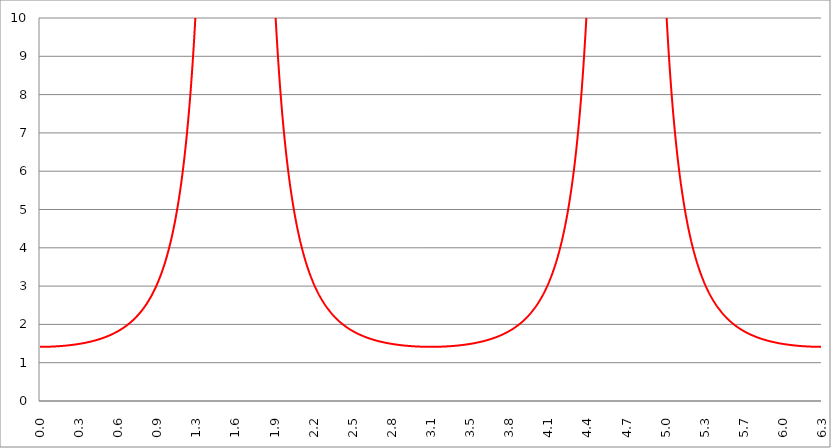
| Category | Series 1 | Series 0 | Series 2 |
|---|---|---|---|
| 0.0 | 1.414 |  |  |
| 0.00314159265358979 | 1.414 |  |  |
| 0.00628318530717958 | 1.414 |  |  |
| 0.00942477796076938 | 1.414 |  |  |
| 0.0125663706143592 | 1.414 |  |  |
| 0.015707963267949 | 1.414 |  |  |
| 0.0188495559215388 | 1.414 |  |  |
| 0.0219911485751285 | 1.415 |  |  |
| 0.0251327412287183 | 1.415 |  |  |
| 0.0282743338823081 | 1.415 |  |  |
| 0.0314159265358979 | 1.415 |  |  |
| 0.0345575191894877 | 1.415 |  |  |
| 0.0376991118430775 | 1.415 |  |  |
| 0.0408407044966673 | 1.415 |  |  |
| 0.0439822971502571 | 1.416 |  |  |
| 0.0471238898038469 | 1.416 |  |  |
| 0.0502654824574367 | 1.416 |  |  |
| 0.0534070751110265 | 1.416 |  |  |
| 0.0565486677646163 | 1.416 |  |  |
| 0.059690260418206 | 1.417 |  |  |
| 0.0628318530717958 | 1.417 |  |  |
| 0.0659734457253856 | 1.417 |  |  |
| 0.0691150383789754 | 1.418 |  |  |
| 0.0722566310325652 | 1.418 |  |  |
| 0.075398223686155 | 1.418 |  |  |
| 0.0785398163397448 | 1.419 |  |  |
| 0.0816814089933346 | 1.419 |  |  |
| 0.0848230016469244 | 1.419 |  |  |
| 0.0879645943005142 | 1.42 |  |  |
| 0.091106186954104 | 1.42 |  |  |
| 0.0942477796076937 | 1.421 |  |  |
| 0.0973893722612835 | 1.421 |  |  |
| 0.100530964914873 | 1.421 |  |  |
| 0.103672557568463 | 1.422 |  |  |
| 0.106814150222053 | 1.422 |  |  |
| 0.109955742875643 | 1.423 |  |  |
| 0.113097335529233 | 1.423 |  |  |
| 0.116238928182822 | 1.424 |  |  |
| 0.119380520836412 | 1.424 |  |  |
| 0.122522113490002 | 1.425 |  |  |
| 0.125663706143592 | 1.426 |  |  |
| 0.128805298797181 | 1.426 |  |  |
| 0.131946891450771 | 1.427 |  |  |
| 0.135088484104361 | 1.427 |  |  |
| 0.138230076757951 | 1.428 |  |  |
| 0.141371669411541 | 1.429 |  |  |
| 0.14451326206513 | 1.429 |  |  |
| 0.14765485471872 | 1.43 |  |  |
| 0.15079644737231 | 1.431 |  |  |
| 0.1539380400259 | 1.431 |  |  |
| 0.15707963267949 | 1.432 |  |  |
| 0.160221225333079 | 1.433 |  |  |
| 0.163362817986669 | 1.434 |  |  |
| 0.166504410640259 | 1.434 |  |  |
| 0.169646003293849 | 1.435 |  |  |
| 0.172787595947439 | 1.436 |  |  |
| 0.175929188601028 | 1.437 |  |  |
| 0.179070781254618 | 1.438 |  |  |
| 0.182212373908208 | 1.438 |  |  |
| 0.185353966561798 | 1.439 |  |  |
| 0.188495559215388 | 1.44 |  |  |
| 0.191637151868977 | 1.441 |  |  |
| 0.194778744522567 | 1.442 |  |  |
| 0.197920337176157 | 1.443 |  |  |
| 0.201061929829747 | 1.444 |  |  |
| 0.204203522483336 | 1.445 |  |  |
| 0.207345115136926 | 1.446 |  |  |
| 0.210486707790516 | 1.447 |  |  |
| 0.213628300444106 | 1.448 |  |  |
| 0.216769893097696 | 1.449 |  |  |
| 0.219911485751285 | 1.45 |  |  |
| 0.223053078404875 | 1.451 |  |  |
| 0.226194671058465 | 1.452 |  |  |
| 0.229336263712055 | 1.453 |  |  |
| 0.232477856365645 | 1.454 |  |  |
| 0.235619449019234 | 1.456 |  |  |
| 0.238761041672824 | 1.457 |  |  |
| 0.241902634326414 | 1.458 |  |  |
| 0.245044226980004 | 1.459 |  |  |
| 0.248185819633594 | 1.46 |  |  |
| 0.251327412287183 | 1.462 |  |  |
| 0.254469004940773 | 1.463 |  |  |
| 0.257610597594363 | 1.464 |  |  |
| 0.260752190247953 | 1.465 |  |  |
| 0.263893782901543 | 1.467 |  |  |
| 0.267035375555132 | 1.468 |  |  |
| 0.270176968208722 | 1.469 |  |  |
| 0.273318560862312 | 1.471 |  |  |
| 0.276460153515902 | 1.472 |  |  |
| 0.279601746169492 | 1.474 |  |  |
| 0.282743338823082 | 1.475 |  |  |
| 0.285884931476671 | 1.477 |  |  |
| 0.289026524130261 | 1.478 |  |  |
| 0.292168116783851 | 1.48 |  |  |
| 0.295309709437441 | 1.481 |  |  |
| 0.298451302091031 | 1.483 |  |  |
| 0.30159289474462 | 1.484 |  |  |
| 0.30473448739821 | 1.486 |  |  |
| 0.3078760800518 | 1.487 |  |  |
| 0.31101767270539 | 1.489 |  |  |
| 0.31415926535898 | 1.491 |  |  |
| 0.31730085801257 | 1.492 |  |  |
| 0.320442450666159 | 1.494 |  |  |
| 0.323584043319749 | 1.496 |  |  |
| 0.326725635973339 | 1.498 |  |  |
| 0.329867228626929 | 1.499 |  |  |
| 0.333008821280519 | 1.501 |  |  |
| 0.336150413934108 | 1.503 |  |  |
| 0.339292006587698 | 1.505 |  |  |
| 0.342433599241288 | 1.507 |  |  |
| 0.345575191894878 | 1.509 |  |  |
| 0.348716784548468 | 1.511 |  |  |
| 0.351858377202058 | 1.513 |  |  |
| 0.354999969855647 | 1.515 |  |  |
| 0.358141562509237 | 1.517 |  |  |
| 0.361283155162827 | 1.519 |  |  |
| 0.364424747816417 | 1.521 |  |  |
| 0.367566340470007 | 1.523 |  |  |
| 0.370707933123597 | 1.525 |  |  |
| 0.373849525777186 | 1.527 |  |  |
| 0.376991118430776 | 1.529 |  |  |
| 0.380132711084366 | 1.531 |  |  |
| 0.383274303737956 | 1.533 |  |  |
| 0.386415896391546 | 1.536 |  |  |
| 0.389557489045135 | 1.538 |  |  |
| 0.392699081698725 | 1.54 |  |  |
| 0.395840674352315 | 1.543 |  |  |
| 0.398982267005905 | 1.545 |  |  |
| 0.402123859659495 | 1.547 |  |  |
| 0.405265452313085 | 1.55 |  |  |
| 0.408407044966674 | 1.552 |  |  |
| 0.411548637620264 | 1.555 |  |  |
| 0.414690230273854 | 1.557 |  |  |
| 0.417831822927444 | 1.56 |  |  |
| 0.420973415581034 | 1.562 |  |  |
| 0.424115008234623 | 1.565 |  |  |
| 0.427256600888213 | 1.568 |  |  |
| 0.430398193541803 | 1.57 |  |  |
| 0.433539786195393 | 1.573 |  |  |
| 0.436681378848983 | 1.576 |  |  |
| 0.439822971502573 | 1.579 |  |  |
| 0.442964564156162 | 1.581 |  |  |
| 0.446106156809752 | 1.584 |  |  |
| 0.449247749463342 | 1.587 |  |  |
| 0.452389342116932 | 1.59 |  |  |
| 0.455530934770522 | 1.593 |  |  |
| 0.458672527424111 | 1.596 |  |  |
| 0.461814120077701 | 1.599 |  |  |
| 0.464955712731291 | 1.602 |  |  |
| 0.468097305384881 | 1.605 |  |  |
| 0.471238898038471 | 1.608 |  |  |
| 0.474380490692061 | 1.611 |  |  |
| 0.47752208334565 | 1.615 |  |  |
| 0.48066367599924 | 1.618 |  |  |
| 0.48380526865283 | 1.621 |  |  |
| 0.48694686130642 | 1.625 |  |  |
| 0.49008845396001 | 1.628 |  |  |
| 0.493230046613599 | 1.631 |  |  |
| 0.496371639267189 | 1.635 |  |  |
| 0.499513231920779 | 1.638 |  |  |
| 0.502654824574369 | 1.642 |  |  |
| 0.505796417227959 | 1.645 |  |  |
| 0.508938009881549 | 1.649 |  |  |
| 0.512079602535138 | 1.653 |  |  |
| 0.515221195188728 | 1.657 |  |  |
| 0.518362787842318 | 1.66 |  |  |
| 0.521504380495908 | 1.664 |  |  |
| 0.524645973149498 | 1.668 |  |  |
| 0.527787565803087 | 1.672 |  |  |
| 0.530929158456677 | 1.676 |  |  |
| 0.534070751110267 | 1.68 |  |  |
| 0.537212343763857 | 1.684 |  |  |
| 0.540353936417447 | 1.688 |  |  |
| 0.543495529071037 | 1.692 |  |  |
| 0.546637121724626 | 1.696 |  |  |
| 0.549778714378216 | 1.701 |  |  |
| 0.552920307031806 | 1.705 |  |  |
| 0.556061899685396 | 1.709 |  |  |
| 0.559203492338986 | 1.714 |  |  |
| 0.562345084992576 | 1.718 |  |  |
| 0.565486677646165 | 1.723 |  |  |
| 0.568628270299755 | 1.727 |  |  |
| 0.571769862953345 | 1.732 |  |  |
| 0.574911455606935 | 1.737 |  |  |
| 0.578053048260525 | 1.741 |  |  |
| 0.581194640914114 | 1.746 |  |  |
| 0.584336233567704 | 1.751 |  |  |
| 0.587477826221294 | 1.756 |  |  |
| 0.590619418874884 | 1.761 |  |  |
| 0.593761011528474 | 1.766 |  |  |
| 0.596902604182064 | 1.771 |  |  |
| 0.600044196835653 | 1.776 |  |  |
| 0.603185789489243 | 1.782 |  |  |
| 0.606327382142833 | 1.787 |  |  |
| 0.609468974796423 | 1.792 |  |  |
| 0.612610567450013 | 1.798 |  |  |
| 0.615752160103602 | 1.803 |  |  |
| 0.618893752757192 | 1.809 |  |  |
| 0.622035345410782 | 1.814 |  |  |
| 0.625176938064372 | 1.82 |  |  |
| 0.628318530717962 | 1.826 |  |  |
| 0.631460123371551 | 1.832 |  |  |
| 0.634601716025141 | 1.838 |  |  |
| 0.637743308678731 | 1.844 |  |  |
| 0.640884901332321 | 1.85 |  |  |
| 0.644026493985911 | 1.856 |  |  |
| 0.647168086639501 | 1.862 |  |  |
| 0.65030967929309 | 1.869 |  |  |
| 0.65345127194668 | 1.875 |  |  |
| 0.65659286460027 | 1.882 |  |  |
| 0.65973445725386 | 1.888 |  |  |
| 0.66287604990745 | 1.895 |  |  |
| 0.666017642561039 | 1.902 |  |  |
| 0.669159235214629 | 1.908 |  |  |
| 0.672300827868219 | 1.915 |  |  |
| 0.675442420521809 | 1.922 |  |  |
| 0.678584013175399 | 1.93 |  |  |
| 0.681725605828989 | 1.937 |  |  |
| 0.684867198482578 | 1.944 |  |  |
| 0.688008791136168 | 1.951 |  |  |
| 0.691150383789758 | 1.959 |  |  |
| 0.694291976443348 | 1.966 |  |  |
| 0.697433569096938 | 1.974 |  |  |
| 0.700575161750528 | 1.982 |  |  |
| 0.703716754404117 | 1.99 |  |  |
| 0.706858347057707 | 1.998 |  |  |
| 0.709999939711297 | 2.006 |  |  |
| 0.713141532364887 | 2.014 |  |  |
| 0.716283125018477 | 2.022 |  |  |
| 0.719424717672066 | 2.031 |  |  |
| 0.722566310325656 | 2.039 |  |  |
| 0.725707902979246 | 2.048 |  |  |
| 0.728849495632836 | 2.057 |  |  |
| 0.731991088286426 | 2.066 |  |  |
| 0.735132680940016 | 2.075 |  |  |
| 0.738274273593605 | 2.084 |  |  |
| 0.741415866247195 | 2.093 |  |  |
| 0.744557458900785 | 2.102 |  |  |
| 0.747699051554375 | 2.112 |  |  |
| 0.750840644207965 | 2.121 |  |  |
| 0.753982236861554 | 2.131 |  |  |
| 0.757123829515144 | 2.141 |  |  |
| 0.760265422168734 | 2.151 |  |  |
| 0.763407014822324 | 2.161 |  |  |
| 0.766548607475914 | 2.171 |  |  |
| 0.769690200129504 | 2.182 |  |  |
| 0.772831792783093 | 2.192 |  |  |
| 0.775973385436683 | 2.203 |  |  |
| 0.779114978090273 | 2.214 |  |  |
| 0.782256570743863 | 2.225 |  |  |
| 0.785398163397453 | 2.236 |  |  |
| 0.788539756051042 | 2.247 |  |  |
| 0.791681348704632 | 2.259 |  |  |
| 0.794822941358222 | 2.27 |  |  |
| 0.797964534011812 | 2.282 |  |  |
| 0.801106126665402 | 2.294 |  |  |
| 0.804247719318992 | 2.306 |  |  |
| 0.807389311972581 | 2.319 |  |  |
| 0.810530904626171 | 2.331 |  |  |
| 0.813672497279761 | 2.344 |  |  |
| 0.816814089933351 | 2.357 |  |  |
| 0.819955682586941 | 2.37 |  |  |
| 0.823097275240531 | 2.383 |  |  |
| 0.82623886789412 | 2.396 |  |  |
| 0.82938046054771 | 2.41 |  |  |
| 0.8325220532013 | 2.424 |  |  |
| 0.83566364585489 | 2.438 |  |  |
| 0.83880523850848 | 2.452 |  |  |
| 0.841946831162069 | 2.466 |  |  |
| 0.845088423815659 | 2.481 |  |  |
| 0.848230016469249 | 2.496 |  |  |
| 0.851371609122839 | 2.511 |  |  |
| 0.854513201776429 | 2.526 |  |  |
| 0.857654794430019 | 2.541 |  |  |
| 0.860796387083608 | 2.557 |  |  |
| 0.863937979737198 | 2.573 |  |  |
| 0.867079572390788 | 2.589 |  |  |
| 0.870221165044378 | 2.606 |  |  |
| 0.873362757697968 | 2.622 |  |  |
| 0.876504350351557 | 2.639 |  |  |
| 0.879645943005147 | 2.657 |  |  |
| 0.882787535658737 | 2.674 |  |  |
| 0.885929128312327 | 2.692 |  |  |
| 0.889070720965917 | 2.71 |  |  |
| 0.892212313619507 | 2.728 |  |  |
| 0.895353906273096 | 2.747 |  |  |
| 0.898495498926686 | 2.765 |  |  |
| 0.901637091580276 | 2.784 |  |  |
| 0.904778684233866 | 2.804 |  |  |
| 0.907920276887456 | 2.824 |  |  |
| 0.911061869541045 | 2.844 |  |  |
| 0.914203462194635 | 2.864 |  |  |
| 0.917345054848225 | 2.885 |  |  |
| 0.920486647501815 | 2.906 |  |  |
| 0.923628240155405 | 2.927 |  |  |
| 0.926769832808995 | 2.949 |  |  |
| 0.929911425462584 | 2.971 |  |  |
| 0.933053018116174 | 2.993 |  |  |
| 0.936194610769764 | 3.016 |  |  |
| 0.939336203423354 | 3.039 |  |  |
| 0.942477796076944 | 3.062 |  |  |
| 0.945619388730533 | 3.086 |  |  |
| 0.948760981384123 | 3.11 |  |  |
| 0.951902574037713 | 3.135 |  |  |
| 0.955044166691303 | 3.16 |  |  |
| 0.958185759344893 | 3.186 |  |  |
| 0.961327351998483 | 3.211 |  |  |
| 0.964468944652072 | 3.238 |  |  |
| 0.967610537305662 | 3.265 |  |  |
| 0.970752129959252 | 3.292 |  |  |
| 0.973893722612842 | 3.319 |  |  |
| 0.977035315266432 | 3.348 |  |  |
| 0.980176907920022 | 3.376 |  |  |
| 0.983318500573611 | 3.405 |  |  |
| 0.986460093227201 | 3.435 |  |  |
| 0.989601685880791 | 3.465 |  |  |
| 0.992743278534381 | 3.496 |  |  |
| 0.995884871187971 | 3.527 |  |  |
| 0.99902646384156 | 3.559 |  |  |
| 1.00216805649515 | 3.591 |  |  |
| 1.00530964914874 | 3.624 |  |  |
| 1.00845124180233 | 3.657 |  |  |
| 1.01159283445592 | 3.691 |  |  |
| 1.01473442710951 | 3.726 |  |  |
| 1.017876019763099 | 3.761 |  |  |
| 1.021017612416689 | 3.797 |  |  |
| 1.02415920507028 | 3.834 |  |  |
| 1.027300797723869 | 3.871 |  |  |
| 1.030442390377459 | 3.909 |  |  |
| 1.033583983031048 | 3.947 |  |  |
| 1.036725575684638 | 3.987 |  |  |
| 1.039867168338228 | 4.027 |  |  |
| 1.043008760991818 | 4.067 |  |  |
| 1.046150353645408 | 4.109 |  |  |
| 1.049291946298998 | 4.151 |  |  |
| 1.052433538952587 | 4.195 |  |  |
| 1.055575131606177 | 4.239 |  |  |
| 1.058716724259767 | 4.283 |  |  |
| 1.061858316913357 | 4.329 |  |  |
| 1.064999909566947 | 4.376 |  |  |
| 1.068141502220536 | 4.423 |  |  |
| 1.071283094874126 | 4.472 |  |  |
| 1.074424687527716 | 4.521 |  |  |
| 1.077566280181306 | 4.571 |  |  |
| 1.080707872834896 | 4.623 |  |  |
| 1.083849465488486 | 4.675 |  |  |
| 1.086991058142075 | 4.729 |  |  |
| 1.090132650795665 | 4.783 |  |  |
| 1.093274243449255 | 4.839 |  |  |
| 1.096415836102845 | 4.896 |  |  |
| 1.099557428756435 | 4.954 |  |  |
| 1.102699021410025 | 5.013 |  |  |
| 1.105840614063614 | 5.073 |  |  |
| 1.108982206717204 | 5.135 |  |  |
| 1.112123799370794 | 5.198 |  |  |
| 1.115265392024384 | 5.263 |  |  |
| 1.118406984677974 | 5.328 |  |  |
| 1.121548577331563 | 5.396 |  |  |
| 1.124690169985153 | 5.464 |  |  |
| 1.127831762638743 | 5.534 |  |  |
| 1.130973355292333 | 5.606 |  |  |
| 1.134114947945923 | 5.679 |  |  |
| 1.137256540599513 | 5.754 |  |  |
| 1.140398133253102 | 5.831 |  |  |
| 1.143539725906692 | 5.909 |  |  |
| 1.146681318560282 | 5.989 |  |  |
| 1.149822911213872 | 6.071 |  |  |
| 1.152964503867462 | 6.155 |  |  |
| 1.156106096521051 | 6.241 |  |  |
| 1.159247689174641 | 6.329 |  |  |
| 1.162389281828231 | 6.418 |  |  |
| 1.165530874481821 | 6.51 |  |  |
| 1.168672467135411 | 6.605 |  |  |
| 1.171814059789001 | 6.701 |  |  |
| 1.17495565244259 | 6.8 |  |  |
| 1.17809724509618 | 6.901 |  |  |
| 1.18123883774977 | 7.005 |  |  |
| 1.18438043040336 | 7.111 |  |  |
| 1.18752202305695 | 7.22 |  |  |
| 1.190663615710539 | 7.332 |  |  |
| 1.193805208364129 | 7.447 |  |  |
| 1.19694680101772 | 7.564 |  |  |
| 1.200088393671309 | 7.685 |  |  |
| 1.203229986324899 | 7.808 |  |  |
| 1.206371578978489 | 7.935 |  |  |
| 1.209513171632078 | 8.066 |  |  |
| 1.212654764285668 | 8.2 |  |  |
| 1.215796356939258 | 8.337 |  |  |
| 1.218937949592848 | 8.478 |  |  |
| 1.222079542246438 | 8.623 |  |  |
| 1.225221134900027 | 8.772 |  |  |
| 1.228362727553617 | 8.925 |  |  |
| 1.231504320207207 | 9.083 |  |  |
| 1.234645912860797 | 9.245 |  |  |
| 1.237787505514387 | 9.412 |  |  |
| 1.240929098167977 | 9.583 |  |  |
| 1.244070690821566 | 9.76 |  |  |
| 1.247212283475156 | 9.941 |  |  |
| 1.250353876128746 | 10.128 |  |  |
| 1.253495468782336 | 10.321 |  |  |
| 1.256637061435926 | 10.52 |  |  |
| 1.259778654089515 | 10.724 |  |  |
| 1.262920246743105 | 10.935 |  |  |
| 1.266061839396695 | 11.153 |  |  |
| 1.269203432050285 | 11.378 |  |  |
| 1.272345024703875 | 11.609 |  |  |
| 1.275486617357465 | 11.848 |  |  |
| 1.278628210011054 | 12.095 |  |  |
| 1.281769802664644 | 12.35 |  |  |
| 1.284911395318234 | 12.614 |  |  |
| 1.288052987971824 | 12.886 |  |  |
| 1.291194580625414 | 13.168 |  |  |
| 1.294336173279003 | 13.46 |  |  |
| 1.297477765932593 | 13.761 |  |  |
| 1.300619358586183 | 14.073 |  |  |
| 1.303760951239773 | 14.397 |  |  |
| 1.306902543893363 | 14.732 |  |  |
| 1.310044136546953 | 15.079 |  |  |
| 1.313185729200542 | 15.439 |  |  |
| 1.316327321854132 | 15.812 |  |  |
| 1.319468914507722 | 16.2 |  |  |
| 1.322610507161312 | 16.602 |  |  |
| 1.325752099814902 | 17.02 |  |  |
| 1.328893692468491 | 17.455 |  |  |
| 1.332035285122081 | 17.907 |  |  |
| 1.335176877775671 | 18.377 |  |  |
| 1.338318470429261 | 18.866 |  |  |
| 1.341460063082851 | 19.376 |  |  |
| 1.344601655736441 | 19.907 |  |  |
| 1.34774324839003 | 20.461 |  |  |
| 1.35088484104362 | 21.038 |  |  |
| 1.35402643369721 | 21.641 |  |  |
| 1.3571680263508 | 22.271 |  |  |
| 1.36030961900439 | 22.929 |  |  |
| 1.363451211657979 | 23.618 |  |  |
| 1.36659280431157 | 24.338 |  |  |
| 1.369734396965159 | 25.093 |  |  |
| 1.372875989618749 | 25.883 |  |  |
| 1.376017582272339 | 26.713 |  |  |
| 1.379159174925929 | 27.583 |  |  |
| 1.382300767579518 | 28.498 |  |  |
| 1.385442360233108 | 29.46 |  |  |
| 1.388583952886698 | 30.471 |  |  |
| 1.391725545540288 | 31.537 |  |  |
| 1.394867138193878 | 32.66 |  |  |
| 1.398008730847468 | 33.845 |  |  |
| 1.401150323501057 | 35.096 |  |  |
| 1.404291916154647 | 36.419 |  |  |
| 1.407433508808237 | 37.819 |  |  |
| 1.410575101461827 | 39.302 |  |  |
| 1.413716694115417 | 40.876 |  |  |
| 1.416858286769006 | 42.546 |  |  |
| 1.419999879422596 | 44.322 |  |  |
| 1.423141472076186 | 46.213 |  |  |
| 1.426283064729776 | 48.228 |  |  |
| 1.429424657383366 | 50.38 |  |  |
| 1.432566250036956 | 52.679 |  |  |
| 1.435707842690545 | 55.141 |  |  |
| 1.438849435344135 | 57.781 |  |  |
| 1.441991027997725 | 60.617 |  |  |
| 1.445132620651315 | 63.668 |  |  |
| 1.448274213304905 | 66.957 |  |  |
| 1.451415805958494 | 70.508 |  |  |
| 1.454557398612084 | 74.352 |  |  |
| 1.457698991265674 | 78.52 |  |  |
| 1.460840583919264 | 83.051 |  |  |
| 1.463982176572854 | 87.988 |  |  |
| 1.467123769226444 | 93.38 |  |  |
| 1.470265361880033 | 99.286 |  |  |
| 1.473406954533623 | 105.772 |  |  |
| 1.476548547187213 | 112.917 |  |  |
| 1.479690139840803 | 120.815 |  |  |
| 1.482831732494393 | 129.574 |  |  |
| 1.485973325147982 | 139.324 |  |  |
| 1.489114917801572 | 150.221 |  |  |
| 1.492256510455162 | 162.451 |  |  |
| 1.495398103108752 | 176.241 |  |  |
| 1.498539695762342 | 191.87 |  |  |
| 1.501681288415932 | 209.677 |  |  |
| 1.504822881069521 | 230.089 |  |  |
| 1.507964473723111 | 253.639 |  |  |
| 1.511106066376701 | 281.003 |  |  |
| 1.514247659030291 | 313.055 |  |  |
| 1.517389251683881 | 350.927 |  |  |
| 1.520530844337471 | 396.121 |  |  |
| 1.52367243699106 | 450.651 |  |  |
| 1.52681402964465 | 517.279 |  |  |
| 1.52995562229824 | 599.868 |  |  |
| 1.53309721495183 | 703.953 |  |  |
| 1.53623880760542 | 837.699 |  |  |
| 1.539380400259009 | 1013.546 |  |  |
| 1.542521992912599 | 1251.213 |  |  |
| 1.545663585566189 | 1583.477 |  |  |
| 1.548805178219779 | 2068.113 |  |  |
| 1.551946770873369 | 2814.811 |  |  |
| 1.555088363526959 | 4053.181 |  |  |
| 1.558229956180548 | 6332.907 |  |  |
| 1.561371548834138 | 11258.243 |  |  |
| 1.564513141487728 | 25330.629 |  |  |
| 1.567654734141318 | 101321.517 |  |  |
| 1.570796326794908 | 8203238119201189953198358528 |  |  |
| 1.573937919448497 | 101321.517 |  |  |
| 1.577079512102087 | 25330.629 |  |  |
| 1.580221104755677 | 11258.243 |  |  |
| 1.583362697409267 | 6332.907 |  |  |
| 1.586504290062857 | 4053.181 |  |  |
| 1.589645882716447 | 2814.811 |  |  |
| 1.592787475370036 | 2068.113 |  |  |
| 1.595929068023626 | 1583.477 |  |  |
| 1.599070660677216 | 1251.213 |  |  |
| 1.602212253330806 | 1013.546 |  |  |
| 1.605353845984396 | 837.699 |  |  |
| 1.608495438637985 | 703.953 |  |  |
| 1.611637031291575 | 599.868 |  |  |
| 1.614778623945165 | 517.279 |  |  |
| 1.617920216598755 | 450.651 |  |  |
| 1.621061809252345 | 396.121 |  |  |
| 1.624203401905935 | 350.927 |  |  |
| 1.627344994559524 | 313.055 |  |  |
| 1.630486587213114 | 281.003 |  |  |
| 1.633628179866704 | 253.639 |  |  |
| 1.636769772520294 | 230.089 |  |  |
| 1.639911365173884 | 209.677 |  |  |
| 1.643052957827473 | 191.87 |  |  |
| 1.646194550481063 | 176.241 |  |  |
| 1.649336143134653 | 162.451 |  |  |
| 1.652477735788243 | 150.221 |  |  |
| 1.655619328441833 | 139.324 |  |  |
| 1.658760921095423 | 129.574 |  |  |
| 1.661902513749012 | 120.815 |  |  |
| 1.665044106402602 | 112.917 |  |  |
| 1.668185699056192 | 105.772 |  |  |
| 1.671327291709782 | 99.286 |  |  |
| 1.674468884363372 | 93.38 |  |  |
| 1.677610477016961 | 87.988 |  |  |
| 1.680752069670551 | 83.051 |  |  |
| 1.683893662324141 | 78.52 |  |  |
| 1.687035254977731 | 74.352 |  |  |
| 1.690176847631321 | 70.508 |  |  |
| 1.693318440284911 | 66.957 |  |  |
| 1.6964600329385 | 63.668 |  |  |
| 1.69960162559209 | 60.617 |  |  |
| 1.70274321824568 | 57.781 |  |  |
| 1.70588481089927 | 55.141 |  |  |
| 1.70902640355286 | 52.679 |  |  |
| 1.712167996206449 | 50.38 |  |  |
| 1.715309588860039 | 48.228 |  |  |
| 1.71845118151363 | 46.213 |  |  |
| 1.721592774167219 | 44.322 |  |  |
| 1.724734366820809 | 42.546 |  |  |
| 1.727875959474399 | 40.876 |  |  |
| 1.731017552127988 | 39.302 |  |  |
| 1.734159144781578 | 37.819 |  |  |
| 1.737300737435168 | 36.419 |  |  |
| 1.740442330088758 | 35.096 |  |  |
| 1.743583922742348 | 33.845 |  |  |
| 1.746725515395937 | 32.66 |  |  |
| 1.749867108049527 | 31.537 |  |  |
| 1.753008700703117 | 30.471 |  |  |
| 1.756150293356707 | 29.46 |  |  |
| 1.759291886010297 | 28.498 |  |  |
| 1.762433478663887 | 27.583 |  |  |
| 1.765575071317476 | 26.713 |  |  |
| 1.768716663971066 | 25.883 |  |  |
| 1.771858256624656 | 25.093 |  |  |
| 1.774999849278246 | 24.338 |  |  |
| 1.778141441931836 | 23.618 |  |  |
| 1.781283034585426 | 22.929 |  |  |
| 1.784424627239015 | 22.271 |  |  |
| 1.787566219892605 | 21.641 |  |  |
| 1.790707812546195 | 21.038 |  |  |
| 1.793849405199785 | 20.461 |  |  |
| 1.796990997853375 | 19.907 |  |  |
| 1.800132590506964 | 19.376 |  |  |
| 1.803274183160554 | 18.866 |  |  |
| 1.806415775814144 | 18.377 |  |  |
| 1.809557368467734 | 17.907 |  |  |
| 1.812698961121324 | 17.455 |  |  |
| 1.815840553774914 | 17.02 |  |  |
| 1.818982146428503 | 16.602 |  |  |
| 1.822123739082093 | 16.2 |  |  |
| 1.825265331735683 | 15.812 |  |  |
| 1.828406924389273 | 15.439 |  |  |
| 1.831548517042863 | 15.079 |  |  |
| 1.834690109696452 | 14.732 |  |  |
| 1.837831702350042 | 14.397 |  |  |
| 1.840973295003632 | 14.073 |  |  |
| 1.844114887657222 | 13.761 |  |  |
| 1.847256480310812 | 13.46 |  |  |
| 1.850398072964402 | 13.168 |  |  |
| 1.853539665617991 | 12.886 |  |  |
| 1.856681258271581 | 12.614 |  |  |
| 1.859822850925171 | 12.35 |  |  |
| 1.862964443578761 | 12.095 |  |  |
| 1.866106036232351 | 11.848 |  |  |
| 1.86924762888594 | 11.609 |  |  |
| 1.87238922153953 | 11.378 |  |  |
| 1.87553081419312 | 11.153 |  |  |
| 1.87867240684671 | 10.935 |  |  |
| 1.8818139995003 | 10.724 |  |  |
| 1.88495559215389 | 10.52 |  |  |
| 1.888097184807479 | 10.321 |  |  |
| 1.891238777461069 | 10.128 |  |  |
| 1.89438037011466 | 9.941 |  |  |
| 1.897521962768249 | 9.76 |  |  |
| 1.900663555421839 | 9.583 |  |  |
| 1.903805148075429 | 9.412 |  |  |
| 1.906946740729018 | 9.245 |  |  |
| 1.910088333382608 | 9.083 |  |  |
| 1.913229926036198 | 8.925 |  |  |
| 1.916371518689788 | 8.772 |  |  |
| 1.919513111343378 | 8.623 |  |  |
| 1.922654703996967 | 8.478 |  |  |
| 1.925796296650557 | 8.337 |  |  |
| 1.928937889304147 | 8.2 |  |  |
| 1.932079481957737 | 8.066 |  |  |
| 1.935221074611327 | 7.935 |  |  |
| 1.938362667264917 | 7.808 |  |  |
| 1.941504259918506 | 7.685 |  |  |
| 1.944645852572096 | 7.564 |  |  |
| 1.947787445225686 | 7.447 |  |  |
| 1.950929037879276 | 7.332 |  |  |
| 1.954070630532866 | 7.22 |  |  |
| 1.957212223186455 | 7.111 |  |  |
| 1.960353815840045 | 7.005 |  |  |
| 1.963495408493635 | 6.901 |  |  |
| 1.966637001147225 | 6.8 |  |  |
| 1.969778593800815 | 6.701 |  |  |
| 1.972920186454405 | 6.605 |  |  |
| 1.976061779107994 | 6.51 |  |  |
| 1.979203371761584 | 6.418 |  |  |
| 1.982344964415174 | 6.329 |  |  |
| 1.985486557068764 | 6.241 |  |  |
| 1.988628149722354 | 6.155 |  |  |
| 1.991769742375943 | 6.071 |  |  |
| 1.994911335029533 | 5.989 |  |  |
| 1.998052927683123 | 5.909 |  |  |
| 2.001194520336712 | 5.831 |  |  |
| 2.004336112990302 | 5.754 |  |  |
| 2.007477705643892 | 5.679 |  |  |
| 2.010619298297482 | 5.606 |  |  |
| 2.013760890951071 | 5.534 |  |  |
| 2.016902483604661 | 5.464 |  |  |
| 2.02004407625825 | 5.396 |  |  |
| 2.02318566891184 | 5.328 |  |  |
| 2.02632726156543 | 5.263 |  |  |
| 2.029468854219019 | 5.198 |  |  |
| 2.032610446872609 | 5.135 |  |  |
| 2.035752039526198 | 5.073 |  |  |
| 2.038893632179788 | 5.013 |  |  |
| 2.042035224833378 | 4.954 |  |  |
| 2.045176817486967 | 4.896 |  |  |
| 2.048318410140557 | 4.839 |  |  |
| 2.051460002794146 | 4.783 |  |  |
| 2.054601595447736 | 4.729 |  |  |
| 2.057743188101325 | 4.675 |  |  |
| 2.060884780754915 | 4.623 |  |  |
| 2.064026373408505 | 4.571 |  |  |
| 2.067167966062094 | 4.521 |  |  |
| 2.070309558715684 | 4.472 |  |  |
| 2.073451151369273 | 4.423 |  |  |
| 2.076592744022863 | 4.376 |  |  |
| 2.079734336676452 | 4.329 |  |  |
| 2.082875929330042 | 4.283 |  |  |
| 2.086017521983632 | 4.239 |  |  |
| 2.089159114637221 | 4.195 |  |  |
| 2.092300707290811 | 4.151 |  |  |
| 2.095442299944401 | 4.109 |  |  |
| 2.09858389259799 | 4.067 |  |  |
| 2.10172548525158 | 4.027 |  |  |
| 2.104867077905169 | 3.987 |  |  |
| 2.108008670558759 | 3.947 |  |  |
| 2.111150263212349 | 3.909 |  |  |
| 2.114291855865938 | 3.871 |  |  |
| 2.117433448519528 | 3.834 |  |  |
| 2.120575041173117 | 3.797 |  |  |
| 2.123716633826707 | 3.761 |  |  |
| 2.126858226480297 | 3.726 |  |  |
| 2.129999819133886 | 3.691 |  |  |
| 2.133141411787476 | 3.657 |  |  |
| 2.136283004441065 | 3.624 |  |  |
| 2.139424597094655 | 3.591 |  |  |
| 2.142566189748245 | 3.559 |  |  |
| 2.145707782401834 | 3.527 |  |  |
| 2.148849375055424 | 3.496 |  |  |
| 2.151990967709013 | 3.465 |  |  |
| 2.155132560362603 | 3.435 |  |  |
| 2.158274153016193 | 3.405 |  |  |
| 2.161415745669782 | 3.376 |  |  |
| 2.164557338323372 | 3.348 |  |  |
| 2.167698930976961 | 3.319 |  |  |
| 2.170840523630551 | 3.292 |  |  |
| 2.173982116284141 | 3.265 |  |  |
| 2.17712370893773 | 3.238 |  |  |
| 2.18026530159132 | 3.211 |  |  |
| 2.183406894244909 | 3.186 |  |  |
| 2.186548486898499 | 3.16 |  |  |
| 2.189690079552089 | 3.135 |  |  |
| 2.192831672205678 | 3.11 |  |  |
| 2.195973264859268 | 3.086 |  |  |
| 2.199114857512857 | 3.062 |  |  |
| 2.202256450166447 | 3.039 |  |  |
| 2.205398042820036 | 3.016 |  |  |
| 2.208539635473626 | 2.993 |  |  |
| 2.211681228127216 | 2.971 |  |  |
| 2.214822820780805 | 2.949 |  |  |
| 2.217964413434395 | 2.927 |  |  |
| 2.221106006087984 | 2.906 |  |  |
| 2.224247598741574 | 2.885 |  |  |
| 2.227389191395164 | 2.864 |  |  |
| 2.230530784048753 | 2.844 |  |  |
| 2.233672376702343 | 2.824 |  |  |
| 2.236813969355933 | 2.804 |  |  |
| 2.239955562009522 | 2.784 |  |  |
| 2.243097154663112 | 2.765 |  |  |
| 2.246238747316701 | 2.747 |  |  |
| 2.249380339970291 | 2.728 |  |  |
| 2.252521932623881 | 2.71 |  |  |
| 2.25566352527747 | 2.692 |  |  |
| 2.25880511793106 | 2.674 |  |  |
| 2.261946710584649 | 2.657 |  |  |
| 2.265088303238239 | 2.639 |  |  |
| 2.268229895891829 | 2.622 |  |  |
| 2.271371488545418 | 2.606 |  |  |
| 2.274513081199008 | 2.589 |  |  |
| 2.277654673852597 | 2.573 |  |  |
| 2.280796266506186 | 2.557 |  |  |
| 2.283937859159776 | 2.541 |  |  |
| 2.287079451813366 | 2.526 |  |  |
| 2.290221044466955 | 2.511 |  |  |
| 2.293362637120545 | 2.496 |  |  |
| 2.296504229774135 | 2.481 |  |  |
| 2.299645822427724 | 2.466 |  |  |
| 2.302787415081314 | 2.452 |  |  |
| 2.305929007734904 | 2.438 |  |  |
| 2.309070600388493 | 2.424 |  |  |
| 2.312212193042083 | 2.41 |  |  |
| 2.315353785695672 | 2.396 |  |  |
| 2.318495378349262 | 2.383 |  |  |
| 2.321636971002852 | 2.37 |  |  |
| 2.324778563656441 | 2.357 |  |  |
| 2.327920156310031 | 2.344 |  |  |
| 2.33106174896362 | 2.331 |  |  |
| 2.33420334161721 | 2.319 |  |  |
| 2.3373449342708 | 2.306 |  |  |
| 2.340486526924389 | 2.294 |  |  |
| 2.343628119577979 | 2.282 |  |  |
| 2.346769712231568 | 2.27 |  |  |
| 2.349911304885158 | 2.259 |  |  |
| 2.353052897538748 | 2.247 |  |  |
| 2.356194490192337 | 2.236 |  |  |
| 2.359336082845927 | 2.225 |  |  |
| 2.362477675499516 | 2.214 |  |  |
| 2.365619268153106 | 2.203 |  |  |
| 2.368760860806696 | 2.192 |  |  |
| 2.371902453460285 | 2.182 |  |  |
| 2.375044046113875 | 2.171 |  |  |
| 2.378185638767464 | 2.161 |  |  |
| 2.381327231421054 | 2.151 |  |  |
| 2.384468824074644 | 2.141 |  |  |
| 2.387610416728233 | 2.131 |  |  |
| 2.390752009381823 | 2.121 |  |  |
| 2.393893602035412 | 2.112 |  |  |
| 2.397035194689002 | 2.102 |  |  |
| 2.400176787342591 | 2.093 |  |  |
| 2.403318379996181 | 2.084 |  |  |
| 2.406459972649771 | 2.075 |  |  |
| 2.40960156530336 | 2.066 |  |  |
| 2.41274315795695 | 2.057 |  |  |
| 2.41588475061054 | 2.048 |  |  |
| 2.419026343264129 | 2.039 |  |  |
| 2.422167935917719 | 2.031 |  |  |
| 2.425309528571308 | 2.022 |  |  |
| 2.428451121224898 | 2.014 |  |  |
| 2.431592713878488 | 2.006 |  |  |
| 2.434734306532077 | 1.998 |  |  |
| 2.437875899185667 | 1.99 |  |  |
| 2.441017491839256 | 1.982 |  |  |
| 2.444159084492846 | 1.974 |  |  |
| 2.447300677146435 | 1.966 |  |  |
| 2.450442269800025 | 1.959 |  |  |
| 2.453583862453615 | 1.951 |  |  |
| 2.456725455107204 | 1.944 |  |  |
| 2.459867047760794 | 1.937 |  |  |
| 2.463008640414384 | 1.93 |  |  |
| 2.466150233067973 | 1.922 |  |  |
| 2.469291825721563 | 1.915 |  |  |
| 2.472433418375152 | 1.908 |  |  |
| 2.475575011028742 | 1.902 |  |  |
| 2.478716603682332 | 1.895 |  |  |
| 2.481858196335921 | 1.888 |  |  |
| 2.48499978898951 | 1.882 |  |  |
| 2.4881413816431 | 1.875 |  |  |
| 2.49128297429669 | 1.869 |  |  |
| 2.49442456695028 | 1.862 |  |  |
| 2.497566159603869 | 1.856 |  |  |
| 2.500707752257458 | 1.85 |  |  |
| 2.503849344911048 | 1.844 |  |  |
| 2.506990937564638 | 1.838 |  |  |
| 2.510132530218228 | 1.832 |  |  |
| 2.513274122871817 | 1.826 |  |  |
| 2.516415715525407 | 1.82 |  |  |
| 2.519557308178996 | 1.814 |  |  |
| 2.522698900832586 | 1.809 |  |  |
| 2.525840493486176 | 1.803 |  |  |
| 2.528982086139765 | 1.798 |  |  |
| 2.532123678793355 | 1.792 |  |  |
| 2.535265271446944 | 1.787 |  |  |
| 2.538406864100534 | 1.782 |  |  |
| 2.541548456754124 | 1.776 |  |  |
| 2.544690049407713 | 1.771 |  |  |
| 2.547831642061302 | 1.766 |  |  |
| 2.550973234714892 | 1.761 |  |  |
| 2.554114827368482 | 1.756 |  |  |
| 2.557256420022072 | 1.751 |  |  |
| 2.560398012675661 | 1.746 |  |  |
| 2.563539605329251 | 1.741 |  |  |
| 2.56668119798284 | 1.737 |  |  |
| 2.56982279063643 | 1.732 |  |  |
| 2.57296438329002 | 1.727 |  |  |
| 2.576105975943609 | 1.723 |  |  |
| 2.579247568597199 | 1.718 |  |  |
| 2.582389161250788 | 1.714 |  |  |
| 2.585530753904377 | 1.709 |  |  |
| 2.588672346557967 | 1.705 |  |  |
| 2.591813939211557 | 1.701 |  |  |
| 2.594955531865147 | 1.696 |  |  |
| 2.598097124518736 | 1.692 |  |  |
| 2.601238717172326 | 1.688 |  |  |
| 2.604380309825915 | 1.684 |  |  |
| 2.607521902479505 | 1.68 |  |  |
| 2.610663495133095 | 1.676 |  |  |
| 2.613805087786684 | 1.672 |  |  |
| 2.616946680440274 | 1.668 |  |  |
| 2.620088273093863 | 1.664 |  |  |
| 2.623229865747452 | 1.66 |  |  |
| 2.626371458401042 | 1.657 |  |  |
| 2.629513051054632 | 1.653 |  |  |
| 2.632654643708222 | 1.649 |  |  |
| 2.635796236361811 | 1.645 |  |  |
| 2.638937829015401 | 1.642 |  |  |
| 2.642079421668991 | 1.638 |  |  |
| 2.64522101432258 | 1.635 |  |  |
| 2.64836260697617 | 1.631 |  |  |
| 2.651504199629759 | 1.628 |  |  |
| 2.654645792283349 | 1.625 |  |  |
| 2.657787384936938 | 1.621 |  |  |
| 2.660928977590528 | 1.618 |  |  |
| 2.664070570244118 | 1.615 |  |  |
| 2.667212162897707 | 1.611 |  |  |
| 2.670353755551297 | 1.608 |  |  |
| 2.673495348204887 | 1.605 |  |  |
| 2.676636940858476 | 1.602 |  |  |
| 2.679778533512066 | 1.599 |  |  |
| 2.682920126165655 | 1.596 |  |  |
| 2.686061718819245 | 1.593 |  |  |
| 2.689203311472835 | 1.59 |  |  |
| 2.692344904126424 | 1.587 |  |  |
| 2.695486496780014 | 1.584 |  |  |
| 2.698628089433603 | 1.581 |  |  |
| 2.701769682087193 | 1.579 |  |  |
| 2.704911274740782 | 1.576 |  |  |
| 2.708052867394372 | 1.573 |  |  |
| 2.711194460047962 | 1.57 |  |  |
| 2.714336052701551 | 1.568 |  |  |
| 2.717477645355141 | 1.565 |  |  |
| 2.720619238008731 | 1.562 |  |  |
| 2.72376083066232 | 1.56 |  |  |
| 2.72690242331591 | 1.557 |  |  |
| 2.730044015969499 | 1.555 |  |  |
| 2.733185608623089 | 1.552 |  |  |
| 2.736327201276678 | 1.55 |  |  |
| 2.739468793930268 | 1.547 |  |  |
| 2.742610386583858 | 1.545 |  |  |
| 2.745751979237447 | 1.543 |  |  |
| 2.748893571891036 | 1.54 |  |  |
| 2.752035164544627 | 1.538 |  |  |
| 2.755176757198216 | 1.536 |  |  |
| 2.758318349851806 | 1.533 |  |  |
| 2.761459942505395 | 1.531 |  |  |
| 2.764601535158985 | 1.529 |  |  |
| 2.767743127812574 | 1.527 |  |  |
| 2.770884720466164 | 1.525 |  |  |
| 2.774026313119754 | 1.523 |  |  |
| 2.777167905773343 | 1.521 |  |  |
| 2.780309498426932 | 1.519 |  |  |
| 2.783451091080522 | 1.517 |  |  |
| 2.786592683734112 | 1.515 |  |  |
| 2.789734276387701 | 1.513 |  |  |
| 2.792875869041291 | 1.511 |  |  |
| 2.796017461694881 | 1.509 |  |  |
| 2.79915905434847 | 1.507 |  |  |
| 2.80230064700206 | 1.505 |  |  |
| 2.80544223965565 | 1.503 |  |  |
| 2.808583832309239 | 1.501 |  |  |
| 2.811725424962829 | 1.499 |  |  |
| 2.814867017616419 | 1.498 |  |  |
| 2.818008610270008 | 1.496 |  |  |
| 2.821150202923598 | 1.494 |  |  |
| 2.824291795577187 | 1.492 |  |  |
| 2.827433388230777 | 1.491 |  |  |
| 2.830574980884366 | 1.489 |  |  |
| 2.833716573537956 | 1.487 |  |  |
| 2.836858166191546 | 1.486 |  |  |
| 2.839999758845135 | 1.484 |  |  |
| 2.843141351498725 | 1.483 |  |  |
| 2.846282944152314 | 1.481 |  |  |
| 2.849424536805904 | 1.48 |  |  |
| 2.852566129459494 | 1.478 |  |  |
| 2.855707722113083 | 1.477 |  |  |
| 2.858849314766673 | 1.475 |  |  |
| 2.861990907420262 | 1.474 |  |  |
| 2.865132500073852 | 1.472 |  |  |
| 2.868274092727442 | 1.471 |  |  |
| 2.871415685381031 | 1.469 |  |  |
| 2.874557278034621 | 1.468 |  |  |
| 2.87769887068821 | 1.467 |  |  |
| 2.8808404633418 | 1.465 |  |  |
| 2.88398205599539 | 1.464 |  |  |
| 2.88712364864898 | 1.463 |  |  |
| 2.890265241302569 | 1.462 |  |  |
| 2.893406833956158 | 1.46 |  |  |
| 2.896548426609748 | 1.459 |  |  |
| 2.899690019263338 | 1.458 |  |  |
| 2.902831611916927 | 1.457 |  |  |
| 2.905973204570517 | 1.456 |  |  |
| 2.909114797224106 | 1.454 |  |  |
| 2.912256389877696 | 1.453 |  |  |
| 2.915397982531286 | 1.452 |  |  |
| 2.918539575184875 | 1.451 |  |  |
| 2.921681167838465 | 1.45 |  |  |
| 2.924822760492054 | 1.449 |  |  |
| 2.927964353145644 | 1.448 |  |  |
| 2.931105945799234 | 1.447 |  |  |
| 2.934247538452823 | 1.446 |  |  |
| 2.937389131106413 | 1.445 |  |  |
| 2.940530723760002 | 1.444 |  |  |
| 2.943672316413592 | 1.443 |  |  |
| 2.946813909067182 | 1.442 |  |  |
| 2.949955501720771 | 1.441 |  |  |
| 2.953097094374361 | 1.44 |  |  |
| 2.95623868702795 | 1.439 |  |  |
| 2.95938027968154 | 1.438 |  |  |
| 2.96252187233513 | 1.438 |  |  |
| 2.965663464988719 | 1.437 |  |  |
| 2.968805057642309 | 1.436 |  |  |
| 2.971946650295898 | 1.435 |  |  |
| 2.975088242949488 | 1.434 |  |  |
| 2.978229835603078 | 1.434 |  |  |
| 2.981371428256667 | 1.433 |  |  |
| 2.984513020910257 | 1.432 |  |  |
| 2.987654613563846 | 1.431 |  |  |
| 2.990796206217436 | 1.431 |  |  |
| 2.993937798871025 | 1.43 |  |  |
| 2.997079391524615 | 1.429 |  |  |
| 3.000220984178205 | 1.429 |  |  |
| 3.003362576831794 | 1.428 |  |  |
| 3.006504169485384 | 1.427 |  |  |
| 3.009645762138974 | 1.427 |  |  |
| 3.012787354792563 | 1.426 |  |  |
| 3.015928947446153 | 1.426 |  |  |
| 3.019070540099742 | 1.425 |  |  |
| 3.022212132753332 | 1.424 |  |  |
| 3.025353725406922 | 1.424 |  |  |
| 3.028495318060511 | 1.423 |  |  |
| 3.031636910714101 | 1.423 |  |  |
| 3.03477850336769 | 1.422 |  |  |
| 3.03792009602128 | 1.422 |  |  |
| 3.04106168867487 | 1.421 |  |  |
| 3.04420328132846 | 1.421 |  |  |
| 3.047344873982049 | 1.421 |  |  |
| 3.050486466635638 | 1.42 |  |  |
| 3.053628059289228 | 1.42 |  |  |
| 3.056769651942818 | 1.419 |  |  |
| 3.059911244596407 | 1.419 |  |  |
| 3.063052837249997 | 1.419 |  |  |
| 3.066194429903586 | 1.418 |  |  |
| 3.069336022557176 | 1.418 |  |  |
| 3.072477615210766 | 1.418 |  |  |
| 3.075619207864355 | 1.417 |  |  |
| 3.078760800517945 | 1.417 |  |  |
| 3.081902393171534 | 1.417 |  |  |
| 3.085043985825124 | 1.416 |  |  |
| 3.088185578478713 | 1.416 |  |  |
| 3.091327171132303 | 1.416 |  |  |
| 3.094468763785893 | 1.416 |  |  |
| 3.097610356439482 | 1.416 |  |  |
| 3.100751949093072 | 1.415 |  |  |
| 3.103893541746661 | 1.415 |  |  |
| 3.107035134400251 | 1.415 |  |  |
| 3.110176727053841 | 1.415 |  |  |
| 3.11331831970743 | 1.415 |  |  |
| 3.11645991236102 | 1.415 |  |  |
| 3.11960150501461 | 1.415 |  |  |
| 3.122743097668199 | 1.414 |  |  |
| 3.125884690321789 | 1.414 |  |  |
| 3.129026282975378 | 1.414 |  |  |
| 3.132167875628968 | 1.414 |  |  |
| 3.135309468282557 | 1.414 |  |  |
| 3.138451060936147 | 1.414 |  |  |
| 3.141592653589737 | 1.414 |  |  |
| 3.144734246243326 | 1.414 |  |  |
| 3.147875838896916 | 1.414 |  |  |
| 3.151017431550505 | 1.414 |  |  |
| 3.154159024204095 | 1.414 |  |  |
| 3.157300616857685 | 1.414 |  |  |
| 3.160442209511274 | 1.414 |  |  |
| 3.163583802164864 | 1.415 |  |  |
| 3.166725394818453 | 1.415 |  |  |
| 3.169866987472043 | 1.415 |  |  |
| 3.173008580125633 | 1.415 |  |  |
| 3.176150172779222 | 1.415 |  |  |
| 3.179291765432812 | 1.415 |  |  |
| 3.182433358086401 | 1.415 |  |  |
| 3.185574950739991 | 1.416 |  |  |
| 3.188716543393581 | 1.416 |  |  |
| 3.19185813604717 | 1.416 |  |  |
| 3.19499972870076 | 1.416 |  |  |
| 3.198141321354349 | 1.416 |  |  |
| 3.20128291400794 | 1.417 |  |  |
| 3.204424506661528 | 1.417 |  |  |
| 3.207566099315118 | 1.417 |  |  |
| 3.210707691968708 | 1.418 |  |  |
| 3.213849284622297 | 1.418 |  |  |
| 3.216990877275887 | 1.418 |  |  |
| 3.220132469929476 | 1.419 |  |  |
| 3.223274062583066 | 1.419 |  |  |
| 3.226415655236656 | 1.419 |  |  |
| 3.229557247890245 | 1.42 |  |  |
| 3.232698840543835 | 1.42 |  |  |
| 3.235840433197425 | 1.421 |  |  |
| 3.238982025851014 | 1.421 |  |  |
| 3.242123618504604 | 1.421 |  |  |
| 3.245265211158193 | 1.422 |  |  |
| 3.248406803811783 | 1.422 |  |  |
| 3.251548396465373 | 1.423 |  |  |
| 3.254689989118962 | 1.423 |  |  |
| 3.257831581772551 | 1.424 |  |  |
| 3.260973174426141 | 1.424 |  |  |
| 3.26411476707973 | 1.425 |  |  |
| 3.267256359733321 | 1.426 |  |  |
| 3.27039795238691 | 1.426 |  |  |
| 3.2735395450405 | 1.427 |  |  |
| 3.276681137694089 | 1.427 |  |  |
| 3.279822730347679 | 1.428 |  |  |
| 3.282964323001269 | 1.429 |  |  |
| 3.286105915654858 | 1.429 |  |  |
| 3.289247508308448 | 1.43 |  |  |
| 3.292389100962037 | 1.431 |  |  |
| 3.295530693615627 | 1.431 |  |  |
| 3.298672286269217 | 1.432 |  |  |
| 3.301813878922806 | 1.433 |  |  |
| 3.304955471576396 | 1.434 |  |  |
| 3.308097064229985 | 1.434 |  |  |
| 3.311238656883575 | 1.435 |  |  |
| 3.314380249537165 | 1.436 |  |  |
| 3.317521842190754 | 1.437 |  |  |
| 3.320663434844344 | 1.438 |  |  |
| 3.323805027497933 | 1.438 |  |  |
| 3.326946620151523 | 1.439 |  |  |
| 3.330088212805113 | 1.44 |  |  |
| 3.333229805458702 | 1.441 |  |  |
| 3.336371398112292 | 1.442 |  |  |
| 3.339512990765881 | 1.443 |  |  |
| 3.342654583419471 | 1.444 |  |  |
| 3.345796176073061 | 1.445 |  |  |
| 3.34893776872665 | 1.446 |  |  |
| 3.35207936138024 | 1.447 |  |  |
| 3.355220954033829 | 1.448 |  |  |
| 3.358362546687419 | 1.449 |  |  |
| 3.361504139341009 | 1.45 |  |  |
| 3.364645731994598 | 1.451 |  |  |
| 3.367787324648188 | 1.452 |  |  |
| 3.370928917301777 | 1.453 |  |  |
| 3.374070509955367 | 1.454 |  |  |
| 3.377212102608956 | 1.456 |  |  |
| 3.380353695262546 | 1.457 |  |  |
| 3.383495287916136 | 1.458 |  |  |
| 3.386636880569725 | 1.459 |  |  |
| 3.389778473223315 | 1.46 |  |  |
| 3.392920065876904 | 1.462 |  |  |
| 3.396061658530494 | 1.463 |  |  |
| 3.399203251184084 | 1.464 |  |  |
| 3.402344843837673 | 1.465 |  |  |
| 3.405486436491263 | 1.467 |  |  |
| 3.408628029144852 | 1.468 |  |  |
| 3.411769621798442 | 1.469 |  |  |
| 3.414911214452032 | 1.471 |  |  |
| 3.418052807105621 | 1.472 |  |  |
| 3.421194399759211 | 1.474 |  |  |
| 3.4243359924128 | 1.475 |  |  |
| 3.42747758506639 | 1.477 |  |  |
| 3.43061917771998 | 1.478 |  |  |
| 3.433760770373569 | 1.48 |  |  |
| 3.436902363027159 | 1.481 |  |  |
| 3.440043955680748 | 1.483 |  |  |
| 3.443185548334338 | 1.484 |  |  |
| 3.446327140987927 | 1.486 |  |  |
| 3.449468733641517 | 1.487 |  |  |
| 3.452610326295107 | 1.489 |  |  |
| 3.455751918948696 | 1.491 |  |  |
| 3.458893511602286 | 1.492 |  |  |
| 3.462035104255876 | 1.494 |  |  |
| 3.465176696909465 | 1.496 |  |  |
| 3.468318289563055 | 1.498 |  |  |
| 3.471459882216644 | 1.499 |  |  |
| 3.474601474870234 | 1.501 |  |  |
| 3.477743067523824 | 1.503 |  |  |
| 3.480884660177413 | 1.505 |  |  |
| 3.484026252831002 | 1.507 |  |  |
| 3.487167845484592 | 1.509 |  |  |
| 3.490309438138182 | 1.511 |  |  |
| 3.493451030791772 | 1.513 |  |  |
| 3.496592623445361 | 1.515 |  |  |
| 3.499734216098951 | 1.517 |  |  |
| 3.50287580875254 | 1.519 |  |  |
| 3.50601740140613 | 1.521 |  |  |
| 3.50915899405972 | 1.523 |  |  |
| 3.512300586713309 | 1.525 |  |  |
| 3.515442179366899 | 1.527 |  |  |
| 3.518583772020488 | 1.529 |  |  |
| 3.521725364674078 | 1.531 |  |  |
| 3.524866957327668 | 1.533 |  |  |
| 3.528008549981257 | 1.536 |  |  |
| 3.531150142634847 | 1.538 |  |  |
| 3.534291735288436 | 1.54 |  |  |
| 3.537433327942026 | 1.543 |  |  |
| 3.540574920595616 | 1.545 |  |  |
| 3.543716513249205 | 1.547 |  |  |
| 3.546858105902795 | 1.55 |  |  |
| 3.549999698556384 | 1.552 |  |  |
| 3.553141291209974 | 1.555 |  |  |
| 3.556282883863564 | 1.557 |  |  |
| 3.559424476517153 | 1.56 |  |  |
| 3.562566069170743 | 1.562 |  |  |
| 3.565707661824332 | 1.565 |  |  |
| 3.568849254477922 | 1.568 |  |  |
| 3.571990847131511 | 1.57 |  |  |
| 3.575132439785101 | 1.573 |  |  |
| 3.578274032438691 | 1.576 |  |  |
| 3.58141562509228 | 1.579 |  |  |
| 3.58455721774587 | 1.581 |  |  |
| 3.58769881039946 | 1.584 |  |  |
| 3.590840403053049 | 1.587 |  |  |
| 3.593981995706639 | 1.59 |  |  |
| 3.597123588360228 | 1.593 |  |  |
| 3.600265181013818 | 1.596 |  |  |
| 3.603406773667407 | 1.599 |  |  |
| 3.606548366320997 | 1.602 |  |  |
| 3.609689958974587 | 1.605 |  |  |
| 3.612831551628176 | 1.608 |  |  |
| 3.615973144281766 | 1.611 |  |  |
| 3.619114736935355 | 1.615 |  |  |
| 3.622256329588945 | 1.618 |  |  |
| 3.625397922242534 | 1.621 |  |  |
| 3.628539514896124 | 1.625 |  |  |
| 3.631681107549714 | 1.628 |  |  |
| 3.634822700203303 | 1.631 |  |  |
| 3.637964292856893 | 1.635 |  |  |
| 3.641105885510483 | 1.638 |  |  |
| 3.644247478164072 | 1.642 |  |  |
| 3.647389070817662 | 1.645 |  |  |
| 3.650530663471251 | 1.649 |  |  |
| 3.653672256124841 | 1.653 |  |  |
| 3.656813848778431 | 1.657 |  |  |
| 3.65995544143202 | 1.66 |  |  |
| 3.66309703408561 | 1.664 |  |  |
| 3.666238626739199 | 1.668 |  |  |
| 3.66938021939279 | 1.672 |  |  |
| 3.672521812046378 | 1.676 |  |  |
| 3.675663404699968 | 1.68 |  |  |
| 3.678804997353558 | 1.684 |  |  |
| 3.681946590007147 | 1.688 |  |  |
| 3.685088182660737 | 1.692 |  |  |
| 3.688229775314326 | 1.696 |  |  |
| 3.691371367967916 | 1.701 |  |  |
| 3.694512960621506 | 1.705 |  |  |
| 3.697654553275095 | 1.709 |  |  |
| 3.700796145928685 | 1.714 |  |  |
| 3.703937738582274 | 1.718 |  |  |
| 3.707079331235864 | 1.723 |  |  |
| 3.710220923889454 | 1.727 |  |  |
| 3.713362516543043 | 1.732 |  |  |
| 3.716504109196633 | 1.737 |  |  |
| 3.719645701850223 | 1.741 |  |  |
| 3.722787294503812 | 1.746 |  |  |
| 3.725928887157402 | 1.751 |  |  |
| 3.729070479810991 | 1.756 |  |  |
| 3.732212072464581 | 1.761 |  |  |
| 3.735353665118171 | 1.766 |  |  |
| 3.73849525777176 | 1.771 |  |  |
| 3.74163685042535 | 1.776 |  |  |
| 3.744778443078939 | 1.782 |  |  |
| 3.747920035732529 | 1.787 |  |  |
| 3.751061628386119 | 1.792 |  |  |
| 3.754203221039708 | 1.798 |  |  |
| 3.757344813693298 | 1.803 |  |  |
| 3.760486406346887 | 1.809 |  |  |
| 3.763627999000477 | 1.814 |  |  |
| 3.766769591654067 | 1.82 |  |  |
| 3.769911184307656 | 1.826 |  |  |
| 3.773052776961246 | 1.832 |  |  |
| 3.776194369614835 | 1.838 |  |  |
| 3.779335962268425 | 1.844 |  |  |
| 3.782477554922014 | 1.85 |  |  |
| 3.785619147575604 | 1.856 |  |  |
| 3.788760740229193 | 1.862 |  |  |
| 3.791902332882783 | 1.869 |  |  |
| 3.795043925536373 | 1.875 |  |  |
| 3.798185518189962 | 1.882 |  |  |
| 3.801327110843552 | 1.888 |  |  |
| 3.804468703497142 | 1.895 |  |  |
| 3.807610296150731 | 1.902 |  |  |
| 3.810751888804321 | 1.908 |  |  |
| 3.813893481457911 | 1.915 |  |  |
| 3.8170350741115 | 1.922 |  |  |
| 3.82017666676509 | 1.93 |  |  |
| 3.823318259418679 | 1.937 |  |  |
| 3.826459852072269 | 1.944 |  |  |
| 3.829601444725859 | 1.951 |  |  |
| 3.832743037379448 | 1.959 |  |  |
| 3.835884630033038 | 1.966 |  |  |
| 3.839026222686627 | 1.974 |  |  |
| 3.842167815340217 | 1.982 |  |  |
| 3.845309407993807 | 1.99 |  |  |
| 3.848451000647396 | 1.998 |  |  |
| 3.851592593300986 | 2.006 |  |  |
| 3.854734185954575 | 2.014 |  |  |
| 3.857875778608165 | 2.022 |  |  |
| 3.861017371261755 | 2.031 |  |  |
| 3.864158963915344 | 2.039 |  |  |
| 3.867300556568933 | 2.048 |  |  |
| 3.870442149222523 | 2.057 |  |  |
| 3.873583741876112 | 2.066 |  |  |
| 3.876725334529703 | 2.075 |  |  |
| 3.879866927183292 | 2.084 |  |  |
| 3.883008519836882 | 2.093 |  |  |
| 3.886150112490471 | 2.102 |  |  |
| 3.889291705144061 | 2.112 |  |  |
| 3.892433297797651 | 2.121 |  |  |
| 3.89557489045124 | 2.131 |  |  |
| 3.89871648310483 | 2.141 |  |  |
| 3.901858075758419 | 2.151 |  |  |
| 3.904999668412009 | 2.161 |  |  |
| 3.908141261065598 | 2.171 |  |  |
| 3.911282853719188 | 2.182 |  |  |
| 3.914424446372778 | 2.192 |  |  |
| 3.917566039026367 | 2.203 |  |  |
| 3.920707631679957 | 2.214 |  |  |
| 3.923849224333547 | 2.225 |  |  |
| 3.926990816987136 | 2.236 |  |  |
| 3.930132409640726 | 2.247 |  |  |
| 3.933274002294315 | 2.259 |  |  |
| 3.936415594947905 | 2.27 |  |  |
| 3.939557187601495 | 2.282 |  |  |
| 3.942698780255084 | 2.294 |  |  |
| 3.945840372908674 | 2.306 |  |  |
| 3.948981965562263 | 2.319 |  |  |
| 3.952123558215853 | 2.331 |  |  |
| 3.955265150869442 | 2.344 |  |  |
| 3.958406743523032 | 2.357 |  |  |
| 3.961548336176622 | 2.37 |  |  |
| 3.964689928830211 | 2.383 |  |  |
| 3.967831521483801 | 2.396 |  |  |
| 3.97097311413739 | 2.41 |  |  |
| 3.97411470679098 | 2.424 |  |  |
| 3.97725629944457 | 2.438 |  |  |
| 3.98039789209816 | 2.452 |  |  |
| 3.983539484751749 | 2.466 |  |  |
| 3.986681077405338 | 2.481 |  |  |
| 3.989822670058928 | 2.496 |  |  |
| 3.992964262712517 | 2.511 |  |  |
| 3.996105855366107 | 2.526 |  |  |
| 3.999247448019697 | 2.541 |  |  |
| 4.002389040673287 | 2.557 |  |  |
| 4.005530633326877 | 2.573 |  |  |
| 4.008672225980466 | 2.589 |  |  |
| 4.011813818634056 | 2.606 |  |  |
| 4.014955411287645 | 2.622 |  |  |
| 4.018097003941234 | 2.639 |  |  |
| 4.021238596594824 | 2.657 |  |  |
| 4.024380189248414 | 2.674 |  |  |
| 4.027521781902004 | 2.692 |  |  |
| 4.030663374555593 | 2.71 |  |  |
| 4.033804967209183 | 2.728 |  |  |
| 4.036946559862773 | 2.747 |  |  |
| 4.040088152516362 | 2.765 |  |  |
| 4.043229745169951 | 2.784 |  |  |
| 4.046371337823541 | 2.804 |  |  |
| 4.049512930477131 | 2.824 |  |  |
| 4.05265452313072 | 2.844 |  |  |
| 4.05579611578431 | 2.864 |  |  |
| 4.0589377084379 | 2.885 |  |  |
| 4.062079301091489 | 2.906 |  |  |
| 4.065220893745079 | 2.927 |  |  |
| 4.068362486398668 | 2.949 |  |  |
| 4.071504079052258 | 2.971 |  |  |
| 4.074645671705848 | 2.993 |  |  |
| 4.077787264359437 | 3.016 |  |  |
| 4.080928857013027 | 3.039 |  |  |
| 4.084070449666616 | 3.062 |  |  |
| 4.087212042320206 | 3.086 |  |  |
| 4.090353634973795 | 3.11 |  |  |
| 4.093495227627385 | 3.135 |  |  |
| 4.096636820280975 | 3.16 |  |  |
| 4.099778412934564 | 3.186 |  |  |
| 4.102920005588154 | 3.211 |  |  |
| 4.106061598241744 | 3.238 |  |  |
| 4.109203190895333 | 3.265 |  |  |
| 4.112344783548923 | 3.292 |  |  |
| 4.115486376202512 | 3.319 |  |  |
| 4.118627968856102 | 3.348 |  |  |
| 4.121769561509692 | 3.376 |  |  |
| 4.124911154163281 | 3.405 |  |  |
| 4.128052746816871 | 3.435 |  |  |
| 4.13119433947046 | 3.465 |  |  |
| 4.13433593212405 | 3.496 |  |  |
| 4.13747752477764 | 3.527 |  |  |
| 4.14061911743123 | 3.559 |  |  |
| 4.143760710084818 | 3.591 |  |  |
| 4.146902302738408 | 3.624 |  |  |
| 4.150043895391998 | 3.657 |  |  |
| 4.153185488045588 | 3.691 |  |  |
| 4.156327080699177 | 3.726 |  |  |
| 4.159468673352766 | 3.761 |  |  |
| 4.162610266006356 | 3.797 |  |  |
| 4.165751858659946 | 3.834 |  |  |
| 4.168893451313535 | 3.871 |  |  |
| 4.172035043967125 | 3.909 |  |  |
| 4.175176636620715 | 3.947 |  |  |
| 4.178318229274304 | 3.987 |  |  |
| 4.181459821927894 | 4.027 |  |  |
| 4.184601414581484 | 4.067 |  |  |
| 4.187743007235073 | 4.109 |  |  |
| 4.190884599888663 | 4.151 |  |  |
| 4.194026192542252 | 4.195 |  |  |
| 4.197167785195842 | 4.239 |  |  |
| 4.200309377849432 | 4.283 |  |  |
| 4.203450970503021 | 4.329 |  |  |
| 4.206592563156611 | 4.376 |  |  |
| 4.2097341558102 | 4.423 |  |  |
| 4.21287574846379 | 4.472 |  |  |
| 4.21601734111738 | 4.521 |  |  |
| 4.21915893377097 | 4.571 |  |  |
| 4.222300526424559 | 4.623 |  |  |
| 4.225442119078148 | 4.675 |  |  |
| 4.228583711731738 | 4.729 |  |  |
| 4.231725304385327 | 4.783 |  |  |
| 4.234866897038917 | 4.839 |  |  |
| 4.238008489692506 | 4.896 |  |  |
| 4.241150082346096 | 4.954 |  |  |
| 4.244291674999685 | 5.013 |  |  |
| 4.247433267653276 | 5.073 |  |  |
| 4.250574860306865 | 5.135 |  |  |
| 4.253716452960455 | 5.198 |  |  |
| 4.256858045614044 | 5.263 |  |  |
| 4.259999638267634 | 5.328 |  |  |
| 4.263141230921224 | 5.396 |  |  |
| 4.266282823574813 | 5.464 |  |  |
| 4.269424416228403 | 5.534 |  |  |
| 4.272566008881992 | 5.606 |  |  |
| 4.275707601535582 | 5.679 |  |  |
| 4.27884919418917 | 5.754 |  |  |
| 4.28199078684276 | 5.831 |  |  |
| 4.285132379496351 | 5.909 |  |  |
| 4.28827397214994 | 5.989 |  |  |
| 4.29141556480353 | 6.071 |  |  |
| 4.294557157457119 | 6.155 |  |  |
| 4.29769875011071 | 6.241 |  |  |
| 4.300840342764299 | 6.329 |  |  |
| 4.303981935417888 | 6.418 |  |  |
| 4.307123528071478 | 6.51 |  |  |
| 4.310265120725067 | 6.605 |  |  |
| 4.313406713378657 | 6.701 |  |  |
| 4.316548306032247 | 6.8 |  |  |
| 4.319689898685836 | 6.901 |  |  |
| 4.322831491339426 | 7.005 |  |  |
| 4.325973083993015 | 7.111 |  |  |
| 4.329114676646605 | 7.22 |  |  |
| 4.332256269300195 | 7.332 |  |  |
| 4.335397861953784 | 7.447 |  |  |
| 4.338539454607374 | 7.564 |  |  |
| 4.341681047260963 | 7.685 |  |  |
| 4.344822639914553 | 7.808 |  |  |
| 4.347964232568143 | 7.935 |  |  |
| 4.351105825221732 | 8.066 |  |  |
| 4.354247417875322 | 8.2 |  |  |
| 4.357389010528911 | 8.337 |  |  |
| 4.360530603182501 | 8.478 |  |  |
| 4.36367219583609 | 8.623 |  |  |
| 4.36681378848968 | 8.772 |  |  |
| 4.36995538114327 | 8.925 |  |  |
| 4.373096973796859 | 9.083 |  |  |
| 4.376238566450449 | 9.245 |  |  |
| 4.379380159104038 | 9.412 |  |  |
| 4.382521751757628 | 9.583 |  |  |
| 4.385663344411217 | 9.76 |  |  |
| 4.388804937064807 | 9.941 |  |  |
| 4.391946529718397 | 10.128 |  |  |
| 4.395088122371987 | 10.321 |  |  |
| 4.398229715025576 | 10.52 |  |  |
| 4.401371307679165 | 10.724 |  |  |
| 4.404512900332755 | 10.935 |  |  |
| 4.407654492986345 | 11.153 |  |  |
| 4.410796085639934 | 11.378 |  |  |
| 4.413937678293524 | 11.609 |  |  |
| 4.417079270947114 | 11.848 |  |  |
| 4.420220863600703 | 12.095 |  |  |
| 4.423362456254293 | 12.35 |  |  |
| 4.426504048907883 | 12.614 |  |  |
| 4.429645641561472 | 12.886 |  |  |
| 4.432787234215062 | 13.168 |  |  |
| 4.435928826868651 | 13.46 |  |  |
| 4.43907041952224 | 13.761 |  |  |
| 4.44221201217583 | 14.073 |  |  |
| 4.44535360482942 | 14.397 |  |  |
| 4.44849519748301 | 14.732 |  |  |
| 4.4516367901366 | 15.079 |  |  |
| 4.454778382790188 | 15.439 |  |  |
| 4.457919975443779 | 15.812 |  |  |
| 4.461061568097368 | 16.2 |  |  |
| 4.464203160750958 | 16.602 |  |  |
| 4.467344753404547 | 17.02 |  |  |
| 4.470486346058137 | 17.455 |  |  |
| 4.473627938711726 | 17.907 |  |  |
| 4.476769531365316 | 18.377 |  |  |
| 4.479911124018905 | 18.866 |  |  |
| 4.483052716672495 | 19.376 |  |  |
| 4.486194309326085 | 19.907 |  |  |
| 4.489335901979674 | 20.461 |  |  |
| 4.492477494633264 | 21.038 |  |  |
| 4.495619087286854 | 21.641 |  |  |
| 4.498760679940443 | 22.271 |  |  |
| 4.501902272594033 | 22.929 |  |  |
| 4.505043865247622 | 23.618 |  |  |
| 4.508185457901212 | 24.338 |  |  |
| 4.511327050554801 | 25.093 |  |  |
| 4.514468643208391 | 25.883 |  |  |
| 4.517610235861981 | 26.713 |  |  |
| 4.520751828515571 | 27.583 |  |  |
| 4.52389342116916 | 28.498 |  |  |
| 4.52703501382275 | 29.46 |  |  |
| 4.530176606476339 | 30.471 |  |  |
| 4.533318199129928 | 31.537 |  |  |
| 4.536459791783518 | 32.66 |  |  |
| 4.539601384437108 | 33.845 |  |  |
| 4.542742977090698 | 35.096 |  |  |
| 4.545884569744287 | 36.419 |  |  |
| 4.549026162397876 | 37.819 |  |  |
| 4.552167755051466 | 39.302 |  |  |
| 4.555309347705056 | 40.876 |  |  |
| 4.558450940358646 | 42.546 |  |  |
| 4.561592533012235 | 44.322 |  |  |
| 4.564734125665825 | 46.213 |  |  |
| 4.567875718319415 | 48.228 |  |  |
| 4.571017310973004 | 50.38 |  |  |
| 4.574158903626594 | 52.679 |  |  |
| 4.577300496280183 | 55.141 |  |  |
| 4.580442088933772 | 57.781 |  |  |
| 4.583583681587362 | 60.617 |  |  |
| 4.586725274240952 | 63.668 |  |  |
| 4.589866866894542 | 66.957 |  |  |
| 4.593008459548131 | 70.508 |  |  |
| 4.596150052201721 | 74.352 |  |  |
| 4.59929164485531 | 78.52 |  |  |
| 4.6024332375089 | 83.051 |  |  |
| 4.60557483016249 | 87.988 |  |  |
| 4.608716422816079 | 93.38 |  |  |
| 4.611858015469668 | 99.286 |  |  |
| 4.614999608123258 | 105.772 |  |  |
| 4.618141200776848 | 112.917 |  |  |
| 4.621282793430437 | 120.815 |  |  |
| 4.624424386084027 | 129.574 |  |  |
| 4.627565978737617 | 139.324 |  |  |
| 4.630707571391206 | 150.221 |  |  |
| 4.633849164044795 | 162.451 |  |  |
| 4.636990756698386 | 176.241 |  |  |
| 4.640132349351975 | 191.87 |  |  |
| 4.643273942005564 | 209.677 |  |  |
| 4.646415534659154 | 230.089 |  |  |
| 4.649557127312744 | 253.639 |  |  |
| 4.652698719966334 | 281.003 |  |  |
| 4.655840312619923 | 313.055 |  |  |
| 4.658981905273513 | 350.927 |  |  |
| 4.662123497927102 | 396.121 |  |  |
| 4.665265090580692 | 450.651 |  |  |
| 4.668406683234282 | 517.279 |  |  |
| 4.671548275887871 | 599.868 |  |  |
| 4.674689868541461 | 703.953 |  |  |
| 4.67783146119505 | 837.699 |  |  |
| 4.68097305384864 | 1013.546 |  |  |
| 4.68411464650223 | 1251.213 |  |  |
| 4.687256239155819 | 1583.477 |  |  |
| 4.690397831809409 | 2068.113 |  |  |
| 4.693539424462998 | 2814.811 |  |  |
| 4.696681017116588 | 4053.181 |  |  |
| 4.699822609770177 | 6332.907 |  |  |
| 4.702964202423767 | 11258.243 |  |  |
| 4.706105795077356 | 25330.629 |  |  |
| 4.709247387730946 | 101321.517 |  |  |
| 4.712388980384535 | 42254127899613098051371008 |  |  |
| 4.715530573038126 | 101321.517 |  |  |
| 4.718672165691715 | 25330.629 |  |  |
| 4.721813758345305 | 11258.243 |  |  |
| 4.724955350998894 | 6332.907 |  |  |
| 4.728096943652484 | 4053.181 |  |  |
| 4.731238536306074 | 2814.811 |  |  |
| 4.734380128959663 | 2068.113 |  |  |
| 4.737521721613253 | 1583.477 |  |  |
| 4.740663314266842 | 1251.213 |  |  |
| 4.743804906920432 | 1013.546 |  |  |
| 4.74694649957402 | 837.699 |  |  |
| 4.750088092227611 | 703.953 |  |  |
| 4.7532296848812 | 599.868 |  |  |
| 4.75637127753479 | 517.279 |  |  |
| 4.75951287018838 | 450.651 |  |  |
| 4.76265446284197 | 396.121 |  |  |
| 4.765796055495559 | 350.927 |  |  |
| 4.768937648149149 | 313.055 |  |  |
| 4.772079240802738 | 281.003 |  |  |
| 4.775220833456327 | 253.639 |  |  |
| 4.778362426109917 | 230.089 |  |  |
| 4.781504018763507 | 209.677 |  |  |
| 4.784645611417097 | 191.87 |  |  |
| 4.787787204070686 | 176.241 |  |  |
| 4.790928796724275 | 162.451 |  |  |
| 4.794070389377865 | 150.221 |  |  |
| 4.797211982031455 | 139.324 |  |  |
| 4.800353574685045 | 129.574 |  |  |
| 4.803495167338634 | 120.815 |  |  |
| 4.806636759992224 | 112.917 |  |  |
| 4.809778352645814 | 105.772 |  |  |
| 4.812919945299403 | 99.286 |  |  |
| 4.816061537952993 | 93.38 |  |  |
| 4.819203130606582 | 87.988 |  |  |
| 4.822344723260172 | 83.051 |  |  |
| 4.825486315913761 | 78.52 |  |  |
| 4.828627908567351 | 74.352 |  |  |
| 4.83176950122094 | 70.508 |  |  |
| 4.83491109387453 | 66.957 |  |  |
| 4.83805268652812 | 63.668 |  |  |
| 4.841194279181709 | 60.617 |  |  |
| 4.844335871835299 | 57.781 |  |  |
| 4.847477464488889 | 55.141 |  |  |
| 4.850619057142478 | 52.679 |  |  |
| 4.853760649796068 | 50.38 |  |  |
| 4.856902242449657 | 48.228 |  |  |
| 4.860043835103247 | 46.213 |  |  |
| 4.863185427756837 | 44.322 |  |  |
| 4.866327020410426 | 42.546 |  |  |
| 4.869468613064015 | 40.876 |  |  |
| 4.872610205717605 | 39.302 |  |  |
| 4.875751798371195 | 37.819 |  |  |
| 4.878893391024784 | 36.419 |  |  |
| 4.882034983678374 | 35.096 |  |  |
| 4.885176576331964 | 33.845 |  |  |
| 4.888318168985553 | 32.66 |  |  |
| 4.891459761639143 | 31.537 |  |  |
| 4.894601354292733 | 30.471 |  |  |
| 4.897742946946322 | 29.46 |  |  |
| 4.900884539599912 | 28.498 |  |  |
| 4.904026132253501 | 27.583 |  |  |
| 4.907167724907091 | 26.713 |  |  |
| 4.91030931756068 | 25.883 |  |  |
| 4.91345091021427 | 25.093 |  |  |
| 4.91659250286786 | 24.338 |  |  |
| 4.91973409552145 | 23.618 |  |  |
| 4.922875688175039 | 22.929 |  |  |
| 4.926017280828628 | 22.271 |  |  |
| 4.929158873482218 | 21.641 |  |  |
| 4.932300466135808 | 21.038 |  |  |
| 4.935442058789397 | 20.461 |  |  |
| 4.938583651442987 | 19.907 |  |  |
| 4.941725244096576 | 19.376 |  |  |
| 4.944866836750166 | 18.866 |  |  |
| 4.948008429403755 | 18.377 |  |  |
| 4.951150022057345 | 17.907 |  |  |
| 4.954291614710935 | 17.455 |  |  |
| 4.957433207364524 | 17.02 |  |  |
| 4.960574800018114 | 16.602 |  |  |
| 4.963716392671704 | 16.2 |  |  |
| 4.966857985325293 | 15.812 |  |  |
| 4.969999577978883 | 15.439 |  |  |
| 4.973141170632472 | 15.079 |  |  |
| 4.976282763286062 | 14.732 |  |  |
| 4.979424355939651 | 14.397 |  |  |
| 4.982565948593241 | 14.073 |  |  |
| 4.985707541246831 | 13.761 |  |  |
| 4.98884913390042 | 13.46 |  |  |
| 4.99199072655401 | 13.168 |  |  |
| 4.9951323192076 | 12.886 |  |  |
| 4.99827391186119 | 12.614 |  |  |
| 5.00141550451478 | 12.35 |  |  |
| 5.004557097168369 | 12.095 |  |  |
| 5.007698689821958 | 11.848 |  |  |
| 5.010840282475548 | 11.609 |  |  |
| 5.013981875129137 | 11.378 |  |  |
| 5.017123467782727 | 11.153 |  |  |
| 5.020265060436317 | 10.935 |  |  |
| 5.023406653089906 | 10.724 |  |  |
| 5.026548245743496 | 10.52 |  |  |
| 5.029689838397085 | 10.321 |  |  |
| 5.032831431050674 | 10.128 |  |  |
| 5.035973023704264 | 9.941 |  |  |
| 5.039114616357854 | 9.76 |  |  |
| 5.042256209011444 | 9.583 |  |  |
| 5.045397801665033 | 9.412 |  |  |
| 5.048539394318622 | 9.245 |  |  |
| 5.051680986972213 | 9.083 |  |  |
| 5.054822579625802 | 8.925 |  |  |
| 5.057964172279392 | 8.772 |  |  |
| 5.061105764932981 | 8.623 |  |  |
| 5.064247357586571 | 8.478 |  |  |
| 5.067388950240161 | 8.337 |  |  |
| 5.07053054289375 | 8.2 |  |  |
| 5.07367213554734 | 8.066 |  |  |
| 5.07681372820093 | 7.935 |  |  |
| 5.079955320854519 | 7.808 |  |  |
| 5.083096913508108 | 7.685 |  |  |
| 5.086238506161698 | 7.564 |  |  |
| 5.089380098815288 | 7.447 |  |  |
| 5.092521691468877 | 7.332 |  |  |
| 5.095663284122466 | 7.22 |  |  |
| 5.098804876776057 | 7.111 |  |  |
| 5.101946469429646 | 7.005 |  |  |
| 5.105088062083236 | 6.901 |  |  |
| 5.108229654736825 | 6.8 |  |  |
| 5.111371247390415 | 6.701 |  |  |
| 5.114512840044005 | 6.605 |  |  |
| 5.117654432697594 | 6.51 |  |  |
| 5.120796025351184 | 6.418 |  |  |
| 5.123937618004773 | 6.329 |  |  |
| 5.127079210658363 | 6.241 |  |  |
| 5.130220803311953 | 6.155 |  |  |
| 5.133362395965542 | 6.071 |  |  |
| 5.136503988619131 | 5.989 |  |  |
| 5.13964558127272 | 5.909 |  |  |
| 5.142787173926311 | 5.831 |  |  |
| 5.1459287665799 | 5.754 |  |  |
| 5.14907035923349 | 5.679 |  |  |
| 5.15221195188708 | 5.606 |  |  |
| 5.15535354454067 | 5.534 |  |  |
| 5.158495137194259 | 5.464 |  |  |
| 5.161636729847848 | 5.396 |  |  |
| 5.164778322501438 | 5.328 |  |  |
| 5.167919915155028 | 5.263 |  |  |
| 5.171061507808617 | 5.198 |  |  |
| 5.174203100462206 | 5.135 |  |  |
| 5.177344693115796 | 5.073 |  |  |
| 5.180486285769386 | 5.013 |  |  |
| 5.183627878422976 | 4.954 |  |  |
| 5.186769471076565 | 4.896 |  |  |
| 5.189911063730155 | 4.839 |  |  |
| 5.193052656383744 | 4.783 |  |  |
| 5.196194249037334 | 4.729 |  |  |
| 5.199335841690924 | 4.675 |  |  |
| 5.202477434344513 | 4.623 |  |  |
| 5.205619026998103 | 4.571 |  |  |
| 5.208760619651692 | 4.521 |  |  |
| 5.211902212305282 | 4.472 |  |  |
| 5.215043804958871 | 4.423 |  |  |
| 5.218185397612461 | 4.376 |  |  |
| 5.221326990266051 | 4.329 |  |  |
| 5.22446858291964 | 4.283 |  |  |
| 5.22761017557323 | 4.239 |  |  |
| 5.23075176822682 | 4.195 |  |  |
| 5.23389336088041 | 4.151 |  |  |
| 5.237034953533999 | 4.109 |  |  |
| 5.240176546187588 | 4.067 |  |  |
| 5.243318138841178 | 4.027 |  |  |
| 5.246459731494767 | 3.987 |  |  |
| 5.249601324148357 | 3.947 |  |  |
| 5.252742916801947 | 3.909 |  |  |
| 5.255884509455536 | 3.871 |  |  |
| 5.259026102109125 | 3.834 |  |  |
| 5.262167694762715 | 3.797 |  |  |
| 5.265309287416305 | 3.761 |  |  |
| 5.268450880069895 | 3.726 |  |  |
| 5.271592472723484 | 3.691 |  |  |
| 5.274734065377074 | 3.657 |  |  |
| 5.277875658030664 | 3.624 |  |  |
| 5.281017250684253 | 3.591 |  |  |
| 5.284158843337843 | 3.559 |  |  |
| 5.287300435991432 | 3.527 |  |  |
| 5.290442028645022 | 3.496 |  |  |
| 5.293583621298612 | 3.465 |  |  |
| 5.296725213952201 | 3.435 |  |  |
| 5.299866806605791 | 3.405 |  |  |
| 5.30300839925938 | 3.376 |  |  |
| 5.30614999191297 | 3.348 |  |  |
| 5.30929158456656 | 3.319 |  |  |
| 5.312433177220149 | 3.292 |  |  |
| 5.315574769873739 | 3.265 |  |  |
| 5.318716362527328 | 3.238 |  |  |
| 5.321857955180918 | 3.211 |  |  |
| 5.324999547834508 | 3.186 |  |  |
| 5.328141140488097 | 3.16 |  |  |
| 5.331282733141686 | 3.135 |  |  |
| 5.334424325795276 | 3.11 |  |  |
| 5.337565918448866 | 3.086 |  |  |
| 5.340707511102456 | 3.062 |  |  |
| 5.343849103756045 | 3.039 |  |  |
| 5.346990696409634 | 3.016 |  |  |
| 5.350132289063224 | 2.993 |  |  |
| 5.353273881716814 | 2.971 |  |  |
| 5.356415474370403 | 2.949 |  |  |
| 5.359557067023993 | 2.927 |  |  |
| 5.362698659677583 | 2.906 |  |  |
| 5.365840252331172 | 2.885 |  |  |
| 5.368981844984762 | 2.864 |  |  |
| 5.372123437638351 | 2.844 |  |  |
| 5.375265030291941 | 2.824 |  |  |
| 5.378406622945531 | 2.804 |  |  |
| 5.38154821559912 | 2.784 |  |  |
| 5.38468980825271 | 2.765 |  |  |
| 5.387831400906299 | 2.747 |  |  |
| 5.39097299355989 | 2.728 |  |  |
| 5.394114586213479 | 2.71 |  |  |
| 5.397256178867068 | 2.692 |  |  |
| 5.400397771520657 | 2.674 |  |  |
| 5.403539364174247 | 2.657 |  |  |
| 5.406680956827837 | 2.639 |  |  |
| 5.409822549481426 | 2.622 |  |  |
| 5.412964142135016 | 2.606 |  |  |
| 5.416105734788605 | 2.589 |  |  |
| 5.419247327442195 | 2.573 |  |  |
| 5.422388920095785 | 2.557 |  |  |
| 5.425530512749375 | 2.541 |  |  |
| 5.428672105402964 | 2.526 |  |  |
| 5.431813698056554 | 2.511 |  |  |
| 5.434955290710143 | 2.496 |  |  |
| 5.438096883363733 | 2.481 |  |  |
| 5.441238476017322 | 2.466 |  |  |
| 5.444380068670912 | 2.452 |  |  |
| 5.447521661324502 | 2.438 |  |  |
| 5.450663253978091 | 2.424 |  |  |
| 5.453804846631681 | 2.41 |  |  |
| 5.456946439285271 | 2.396 |  |  |
| 5.46008803193886 | 2.383 |  |  |
| 5.46322962459245 | 2.37 |  |  |
| 5.466371217246039 | 2.357 |  |  |
| 5.46951280989963 | 2.344 |  |  |
| 5.472654402553218 | 2.331 |  |  |
| 5.475795995206808 | 2.319 |  |  |
| 5.478937587860398 | 2.306 |  |  |
| 5.482079180513987 | 2.294 |  |  |
| 5.485220773167577 | 2.282 |  |  |
| 5.488362365821166 | 2.27 |  |  |
| 5.491503958474756 | 2.259 |  |  |
| 5.494645551128346 | 2.247 |  |  |
| 5.497787143781935 | 2.236 |  |  |
| 5.500928736435525 | 2.225 |  |  |
| 5.504070329089115 | 2.214 |  |  |
| 5.507211921742704 | 2.203 |  |  |
| 5.510353514396294 | 2.192 |  |  |
| 5.513495107049883 | 2.182 |  |  |
| 5.516636699703473 | 2.171 |  |  |
| 5.519778292357062 | 2.161 |  |  |
| 5.522919885010652 | 2.151 |  |  |
| 5.526061477664242 | 2.141 |  |  |
| 5.529203070317831 | 2.131 |  |  |
| 5.532344662971421 | 2.121 |  |  |
| 5.535486255625011 | 2.112 |  |  |
| 5.5386278482786 | 2.102 |  |  |
| 5.54176944093219 | 2.093 |  |  |
| 5.544911033585779 | 2.084 |  |  |
| 5.54805262623937 | 2.075 |  |  |
| 5.551194218892959 | 2.066 |  |  |
| 5.554335811546548 | 2.057 |  |  |
| 5.557477404200137 | 2.048 |  |  |
| 5.560618996853727 | 2.039 |  |  |
| 5.563760589507317 | 2.031 |  |  |
| 5.566902182160906 | 2.022 |  |  |
| 5.570043774814496 | 2.014 |  |  |
| 5.573185367468086 | 2.006 |  |  |
| 5.576326960121675 | 1.998 |  |  |
| 5.579468552775264 | 1.99 |  |  |
| 5.582610145428854 | 1.982 |  |  |
| 5.585751738082444 | 1.974 |  |  |
| 5.588893330736034 | 1.966 |  |  |
| 5.592034923389623 | 1.959 |  |  |
| 5.595176516043213 | 1.951 |  |  |
| 5.598318108696803 | 1.944 |  |  |
| 5.601459701350392 | 1.937 |  |  |
| 5.604601294003982 | 1.93 |  |  |
| 5.607742886657571 | 1.922 |  |  |
| 5.610884479311161 | 1.915 |  |  |
| 5.61402607196475 | 1.908 |  |  |
| 5.61716766461834 | 1.902 |  |  |
| 5.62030925727193 | 1.895 |  |  |
| 5.623450849925519 | 1.888 |  |  |
| 5.626592442579109 | 1.882 |  |  |
| 5.629734035232698 | 1.875 |  |  |
| 5.632875627886288 | 1.869 |  |  |
| 5.636017220539878 | 1.862 |  |  |
| 5.639158813193467 | 1.856 |  |  |
| 5.642300405847057 | 1.85 |  |  |
| 5.645441998500646 | 1.844 |  |  |
| 5.648583591154236 | 1.838 |  |  |
| 5.651725183807825 | 1.832 |  |  |
| 5.654866776461415 | 1.826 |  |  |
| 5.658008369115005 | 1.82 |  |  |
| 5.661149961768594 | 1.814 |  |  |
| 5.664291554422184 | 1.809 |  |  |
| 5.667433147075774 | 1.803 |  |  |
| 5.670574739729363 | 1.798 |  |  |
| 5.673716332382953 | 1.792 |  |  |
| 5.676857925036542 | 1.787 |  |  |
| 5.679999517690132 | 1.782 |  |  |
| 5.683141110343721 | 1.776 |  |  |
| 5.686282702997311 | 1.771 |  |  |
| 5.689424295650901 | 1.766 |  |  |
| 5.69256588830449 | 1.761 |  |  |
| 5.69570748095808 | 1.756 |  |  |
| 5.69884907361167 | 1.751 |  |  |
| 5.701990666265259 | 1.746 |  |  |
| 5.705132258918849 | 1.741 |  |  |
| 5.708273851572438 | 1.737 |  |  |
| 5.711415444226028 | 1.732 |  |  |
| 5.714557036879618 | 1.727 |  |  |
| 5.717698629533207 | 1.723 |  |  |
| 5.720840222186797 | 1.718 |  |  |
| 5.723981814840386 | 1.714 |  |  |
| 5.727123407493976 | 1.709 |  |  |
| 5.730265000147565 | 1.705 |  |  |
| 5.733406592801155 | 1.701 |  |  |
| 5.736548185454744 | 1.696 |  |  |
| 5.739689778108334 | 1.692 |  |  |
| 5.742831370761924 | 1.688 |  |  |
| 5.745972963415514 | 1.684 |  |  |
| 5.749114556069103 | 1.68 |  |  |
| 5.752256148722693 | 1.676 |  |  |
| 5.755397741376282 | 1.672 |  |  |
| 5.758539334029872 | 1.668 |  |  |
| 5.761680926683462 | 1.664 |  |  |
| 5.764822519337051 | 1.66 |  |  |
| 5.767964111990641 | 1.657 |  |  |
| 5.77110570464423 | 1.653 |  |  |
| 5.77424729729782 | 1.649 |  |  |
| 5.77738888995141 | 1.645 |  |  |
| 5.780530482605 | 1.642 |  |  |
| 5.783672075258588 | 1.638 |  |  |
| 5.786813667912178 | 1.635 |  |  |
| 5.789955260565768 | 1.631 |  |  |
| 5.793096853219358 | 1.628 |  |  |
| 5.796238445872947 | 1.625 |  |  |
| 5.799380038526537 | 1.621 |  |  |
| 5.802521631180126 | 1.618 |  |  |
| 5.805663223833715 | 1.615 |  |  |
| 5.808804816487306 | 1.611 |  |  |
| 5.811946409140895 | 1.608 |  |  |
| 5.815088001794485 | 1.605 |  |  |
| 5.818229594448074 | 1.602 |  |  |
| 5.821371187101663 | 1.599 |  |  |
| 5.824512779755254 | 1.596 |  |  |
| 5.827654372408843 | 1.593 |  |  |
| 5.830795965062433 | 1.59 |  |  |
| 5.833937557716022 | 1.587 |  |  |
| 5.837079150369612 | 1.584 |  |  |
| 5.840220743023201 | 1.581 |  |  |
| 5.843362335676791 | 1.579 |  |  |
| 5.846503928330381 | 1.576 |  |  |
| 5.84964552098397 | 1.573 |  |  |
| 5.85278711363756 | 1.57 |  |  |
| 5.85592870629115 | 1.568 |  |  |
| 5.85907029894474 | 1.565 |  |  |
| 5.862211891598329 | 1.562 |  |  |
| 5.865353484251918 | 1.56 |  |  |
| 5.868495076905508 | 1.557 |  |  |
| 5.871636669559098 | 1.555 |  |  |
| 5.874778262212687 | 1.552 |  |  |
| 5.877919854866277 | 1.55 |  |  |
| 5.881061447519866 | 1.547 |  |  |
| 5.884203040173456 | 1.545 |  |  |
| 5.887344632827046 | 1.543 |  |  |
| 5.890486225480635 | 1.54 |  |  |
| 5.893627818134224 | 1.538 |  |  |
| 5.896769410787814 | 1.536 |  |  |
| 5.899911003441404 | 1.533 |  |  |
| 5.903052596094994 | 1.531 |  |  |
| 5.906194188748583 | 1.529 |  |  |
| 5.909335781402172 | 1.527 |  |  |
| 5.912477374055762 | 1.525 |  |  |
| 5.915618966709352 | 1.523 |  |  |
| 5.918760559362942 | 1.521 |  |  |
| 5.921902152016531 | 1.519 |  |  |
| 5.92504374467012 | 1.517 |  |  |
| 5.92818533732371 | 1.515 |  |  |
| 5.9313269299773 | 1.513 |  |  |
| 5.93446852263089 | 1.511 |  |  |
| 5.93761011528448 | 1.509 |  |  |
| 5.940751707938068 | 1.507 |  |  |
| 5.943893300591658 | 1.505 |  |  |
| 5.947034893245248 | 1.503 |  |  |
| 5.950176485898837 | 1.501 |  |  |
| 5.953318078552427 | 1.499 |  |  |
| 5.956459671206017 | 1.498 |  |  |
| 5.959601263859606 | 1.496 |  |  |
| 5.962742856513196 | 1.494 |  |  |
| 5.965884449166785 | 1.492 |  |  |
| 5.969026041820375 | 1.491 |  |  |
| 5.972167634473964 | 1.489 |  |  |
| 5.975309227127554 | 1.487 |  |  |
| 5.978450819781144 | 1.486 |  |  |
| 5.981592412434733 | 1.484 |  |  |
| 5.984734005088323 | 1.483 |  |  |
| 5.987875597741913 | 1.481 |  |  |
| 5.991017190395502 | 1.48 |  |  |
| 5.994158783049092 | 1.478 |  |  |
| 5.997300375702681 | 1.477 |  |  |
| 6.000441968356271 | 1.475 |  |  |
| 6.003583561009861 | 1.474 |  |  |
| 6.00672515366345 | 1.472 |  |  |
| 6.00986674631704 | 1.471 |  |  |
| 6.01300833897063 | 1.469 |  |  |
| 6.01614993162422 | 1.468 |  |  |
| 6.019291524277808 | 1.467 |  |  |
| 6.022433116931398 | 1.465 |  |  |
| 6.025574709584988 | 1.464 |  |  |
| 6.028716302238577 | 1.463 |  |  |
| 6.031857894892167 | 1.462 |  |  |
| 6.034999487545757 | 1.46 |  |  |
| 6.038141080199346 | 1.459 |  |  |
| 6.041282672852935 | 1.458 |  |  |
| 6.044424265506525 | 1.457 |  |  |
| 6.047565858160115 | 1.456 |  |  |
| 6.050707450813704 | 1.454 |  |  |
| 6.053849043467294 | 1.453 |  |  |
| 6.056990636120884 | 1.452 |  |  |
| 6.060132228774473 | 1.451 |  |  |
| 6.063273821428063 | 1.45 |  |  |
| 6.066415414081653 | 1.449 |  |  |
| 6.069557006735242 | 1.448 |  |  |
| 6.072698599388831 | 1.447 |  |  |
| 6.07584019204242 | 1.446 |  |  |
| 6.078981784696011 | 1.445 |  |  |
| 6.082123377349601 | 1.444 |  |  |
| 6.08526497000319 | 1.443 |  |  |
| 6.08840656265678 | 1.442 |  |  |
| 6.09154815531037 | 1.441 |  |  |
| 6.094689747963959 | 1.44 |  |  |
| 6.097831340617549 | 1.439 |  |  |
| 6.100972933271138 | 1.438 |  |  |
| 6.104114525924728 | 1.438 |  |  |
| 6.107256118578317 | 1.437 |  |  |
| 6.110397711231907 | 1.436 |  |  |
| 6.113539303885497 | 1.435 |  |  |
| 6.116680896539086 | 1.434 |  |  |
| 6.119822489192675 | 1.434 |  |  |
| 6.122964081846265 | 1.433 |  |  |
| 6.126105674499855 | 1.432 |  |  |
| 6.129247267153445 | 1.431 |  |  |
| 6.132388859807034 | 1.431 |  |  |
| 6.135530452460624 | 1.43 |  |  |
| 6.138672045114213 | 1.429 |  |  |
| 6.141813637767803 | 1.429 |  |  |
| 6.144955230421393 | 1.428 |  |  |
| 6.148096823074982 | 1.427 |  |  |
| 6.151238415728571 | 1.427 |  |  |
| 6.154380008382161 | 1.426 |  |  |
| 6.157521601035751 | 1.426 |  |  |
| 6.16066319368934 | 1.425 |  |  |
| 6.16380478634293 | 1.424 |  |  |
| 6.16694637899652 | 1.424 |  |  |
| 6.170087971650109 | 1.423 |  |  |
| 6.173229564303698 | 1.423 |  |  |
| 6.176371156957289 | 1.422 |  |  |
| 6.179512749610878 | 1.422 |  |  |
| 6.182654342264468 | 1.421 |  |  |
| 6.185795934918057 | 1.421 |  |  |
| 6.188937527571647 | 1.421 |  |  |
| 6.192079120225237 | 1.42 |  |  |
| 6.195220712878826 | 1.42 |  |  |
| 6.198362305532415 | 1.419 |  |  |
| 6.201503898186005 | 1.419 |  |  |
| 6.204645490839594 | 1.419 |  |  |
| 6.207787083493184 | 1.418 |  |  |
| 6.210928676146774 | 1.418 |  |  |
| 6.214070268800364 | 1.418 |  |  |
| 6.217211861453953 | 1.417 |  |  |
| 6.220353454107543 | 1.417 |  |  |
| 6.223495046761133 | 1.417 |  |  |
| 6.226636639414722 | 1.416 |  |  |
| 6.229778232068312 | 1.416 |  |  |
| 6.232919824721901 | 1.416 |  |  |
| 6.236061417375491 | 1.416 |  |  |
| 6.23920301002908 | 1.416 |  |  |
| 6.24234460268267 | 1.415 |  |  |
| 6.24548619533626 | 1.415 |  |  |
| 6.24862778798985 | 1.415 |  |  |
| 6.251769380643438 | 1.415 |  |  |
| 6.254910973297028 | 1.415 |  |  |
| 6.258052565950618 | 1.415 |  |  |
| 6.261194158604208 | 1.415 |  |  |
| 6.264335751257797 | 1.414 |  |  |
| 6.267477343911387 | 1.414 |  |  |
| 6.270618936564976 | 1.414 |  |  |
| 6.273760529218566 | 1.414 |  |  |
| 6.276902121872155 | 1.414 |  |  |
| 6.280043714525745 | 1.414 |  |  |
| 6.283185307179335 | 1.414 |  |  |